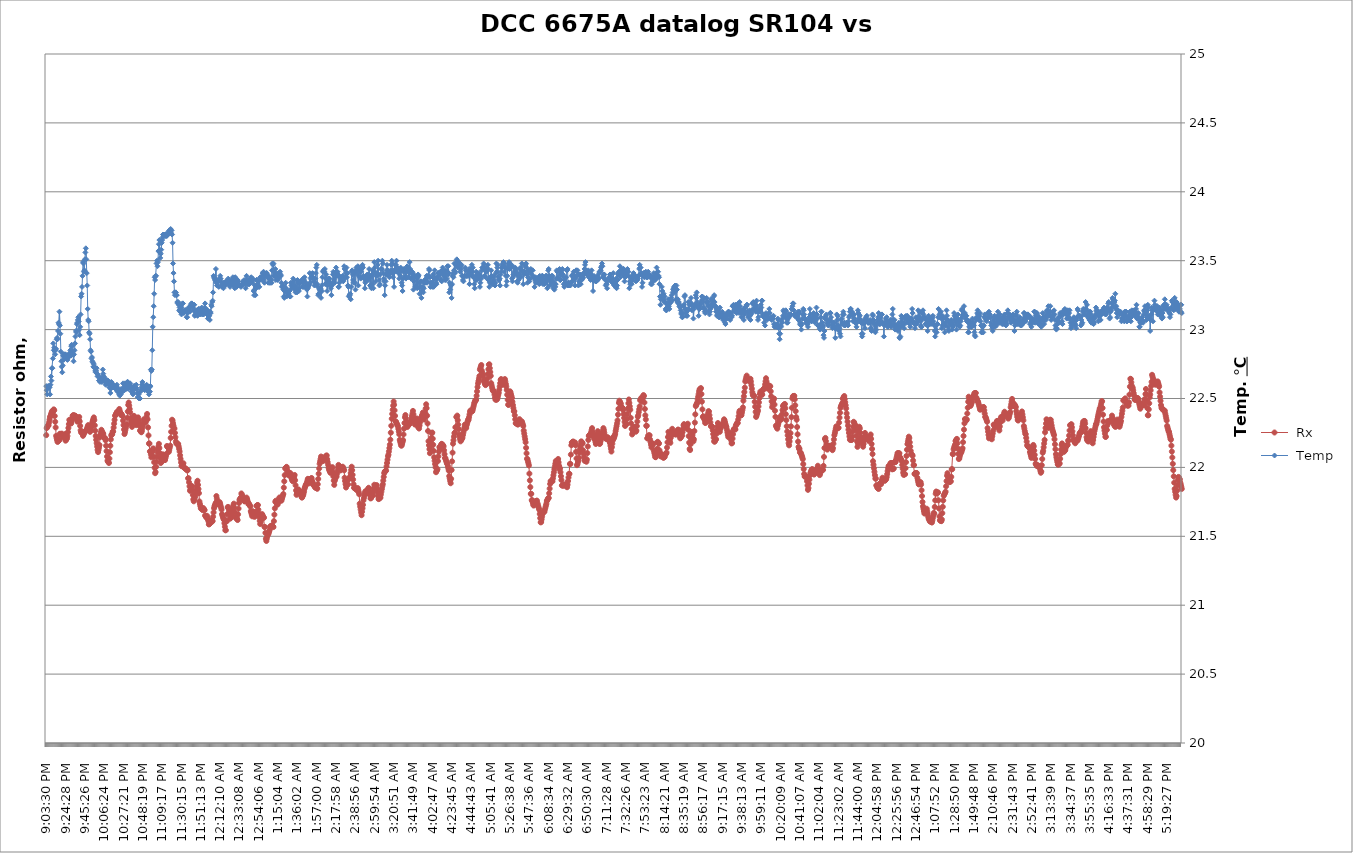
| Category |  Rx |
|---|---|
| 2021-03-04 21:03:30 | 9999.897 |
| 2021-03-04 21:04:01 | 9999.897 |
| 2021-03-04 21:04:32 | 9999.897 |
| 2021-03-04 21:05:02 | 9999.897 |
| 2021-03-04 21:05:33 | 9999.897 |
| 2021-03-04 21:06:04 | 9999.897 |
| 2021-03-04 21:06:34 | 9999.897 |
| 2021-03-04 21:07:05 | 9999.897 |
| 2021-03-04 21:07:36 | 9999.897 |
| 2021-03-04 21:08:06 | 9999.897 |
| 2021-03-04 21:08:37 | 9999.897 |
| 2021-03-04 21:09:08 | 9999.897 |
| 2021-03-04 21:09:38 | 9999.897 |
| 2021-03-04 21:10:09 | 9999.897 |
| 2021-03-04 21:10:40 | 9999.897 |
| 2021-03-04 21:11:10 | 9999.897 |
| 2021-03-04 21:11:41 | 9999.897 |
| 2021-03-04 21:12:12 | 9999.897 |
| 2021-03-04 21:12:42 | 9999.897 |
| 2021-03-04 21:13:13 | 9999.897 |
| 2021-03-04 21:13:44 | 9999.897 |
| 2021-03-04 21:14:14 | 9999.897 |
| 2021-03-04 21:14:45 | 9999.897 |
| 2021-03-04 21:15:16 | 9999.897 |
| 2021-03-04 21:15:46 | 9999.897 |
| 2021-03-04 21:16:17 | 9999.897 |
| 2021-03-04 21:16:48 | 9999.897 |
| 2021-03-04 21:17:19 | 9999.897 |
| 2021-03-04 21:17:49 | 9999.897 |
| 2021-03-04 21:18:20 | 9999.897 |
| 2021-03-04 21:18:51 | 9999.897 |
| 2021-03-04 21:19:21 | 9999.897 |
| 2021-03-04 21:19:52 | 9999.897 |
| 2021-03-04 21:20:23 | 9999.897 |
| 2021-03-04 21:20:53 | 9999.897 |
| 2021-03-04 21:21:24 | 9999.897 |
| 2021-03-04 21:21:55 | 9999.897 |
| 2021-03-04 21:22:25 | 9999.897 |
| 2021-03-04 21:22:56 | 9999.897 |
| 2021-03-04 21:23:27 | 9999.897 |
| 2021-03-04 21:23:57 | 9999.897 |
| 2021-03-04 21:24:28 | 9999.897 |
| 2021-03-04 21:24:59 | 9999.897 |
| 2021-03-04 21:25:29 | 9999.897 |
| 2021-03-04 21:26:00 | 9999.897 |
| 2021-03-04 21:26:31 | 9999.897 |
| 2021-03-04 21:27:01 | 9999.897 |
| 2021-03-04 21:27:32 | 9999.897 |
| 2021-03-04 21:28:03 | 9999.897 |
| 2021-03-04 21:28:33 | 9999.897 |
| 2021-03-04 21:29:04 | 9999.897 |
| 2021-03-04 21:29:35 | 9999.897 |
| 2021-03-04 21:30:05 | 9999.897 |
| 2021-03-04 21:30:36 | 9999.897 |
| 2021-03-04 21:31:07 | 9999.897 |
| 2021-03-04 21:31:37 | 9999.897 |
| 2021-03-04 21:32:08 | 9999.897 |
| 2021-03-04 21:32:39 | 9999.897 |
| 2021-03-04 21:33:10 | 9999.897 |
| 2021-03-04 21:33:40 | 9999.897 |
| 2021-03-04 21:34:11 | 9999.897 |
| 2021-03-04 21:34:42 | 9999.897 |
| 2021-03-04 21:35:12 | 9999.897 |
| 2021-03-04 21:35:43 | 9999.897 |
| 2021-03-04 21:36:14 | 9999.897 |
| 2021-03-04 21:36:44 | 9999.897 |
| 2021-03-04 21:37:15 | 9999.897 |
| 2021-03-04 21:37:46 | 9999.897 |
| 2021-03-04 21:38:16 | 9999.897 |
| 2021-03-04 21:38:47 | 9999.897 |
| 2021-03-04 21:39:18 | 9999.897 |
| 2021-03-04 21:39:48 | 9999.897 |
| 2021-03-04 21:40:19 | 9999.897 |
| 2021-03-04 21:40:50 | 9999.897 |
| 2021-03-04 21:41:20 | 9999.897 |
| 2021-03-04 21:41:51 | 9999.897 |
| 2021-03-04 21:42:22 | 9999.897 |
| 2021-03-04 21:42:52 | 9999.897 |
| 2021-03-04 21:43:23 | 9999.897 |
| 2021-03-04 21:43:54 | 9999.897 |
| 2021-03-04 21:44:24 | 9999.897 |
| 2021-03-04 21:44:55 | 9999.897 |
| 2021-03-04 21:45:26 | 9999.897 |
| 2021-03-04 21:45:57 | 9999.897 |
| 2021-03-04 21:46:27 | 9999.897 |
| 2021-03-04 21:46:58 | 9999.897 |
| 2021-03-04 21:47:29 | 9999.897 |
| 2021-03-04 21:47:59 | 9999.897 |
| 2021-03-04 21:48:30 | 9999.897 |
| 2021-03-04 21:49:01 | 9999.897 |
| 2021-03-04 21:49:31 | 9999.897 |
| 2021-03-04 21:50:02 | 9999.897 |
| 2021-03-04 21:50:33 | 9999.897 |
| 2021-03-04 21:51:03 | 9999.897 |
| 2021-03-04 21:51:34 | 9999.897 |
| 2021-03-04 21:52:05 | 9999.897 |
| 2021-03-04 21:52:35 | 9999.897 |
| 2021-03-04 21:53:06 | 9999.897 |
| 2021-03-04 21:53:37 | 9999.897 |
| 2021-03-04 21:54:07 | 9999.897 |
| 2021-03-04 21:54:38 | 9999.897 |
| 2021-03-04 21:55:09 | 9999.897 |
| 2021-03-04 21:55:39 | 9999.897 |
| 2021-03-04 21:56:10 | 9999.897 |
| 2021-03-04 21:56:41 | 9999.897 |
| 2021-03-04 21:57:11 | 9999.897 |
| 2021-03-04 21:57:42 | 9999.897 |
| 2021-03-04 21:58:13 | 9999.897 |
| 2021-03-04 21:58:43 | 9999.897 |
| 2021-03-04 21:59:14 | 9999.897 |
| 2021-03-04 21:59:45 | 9999.897 |
| 2021-03-04 22:00:15 | 9999.897 |
| 2021-03-04 22:00:46 | 9999.897 |
| 2021-03-04 22:01:17 | 9999.897 |
| 2021-03-04 22:01:48 | 9999.897 |
| 2021-03-04 22:02:18 | 9999.897 |
| 2021-03-04 22:02:49 | 9999.897 |
| 2021-03-04 22:03:20 | 9999.897 |
| 2021-03-04 22:03:50 | 9999.897 |
| 2021-03-04 22:04:21 | 9999.897 |
| 2021-03-04 22:04:52 | 9999.897 |
| 2021-03-04 22:05:22 | 9999.897 |
| 2021-03-04 22:05:53 | 9999.897 |
| 2021-03-04 22:06:24 | 9999.897 |
| 2021-03-04 22:06:54 | 9999.897 |
| 2021-03-04 22:07:25 | 9999.897 |
| 2021-03-04 22:07:56 | 9999.897 |
| 2021-03-04 22:08:26 | 9999.897 |
| 2021-03-04 22:08:57 | 9999.897 |
| 2021-03-04 22:09:28 | 9999.897 |
| 2021-03-04 22:09:58 | 9999.897 |
| 2021-03-04 22:10:29 | 9999.897 |
| 2021-03-04 22:11:00 | 9999.897 |
| 2021-03-04 22:11:30 | 9999.897 |
| 2021-03-04 22:12:01 | 9999.897 |
| 2021-03-04 22:12:32 | 9999.897 |
| 2021-03-04 22:13:02 | 9999.897 |
| 2021-03-04 22:13:33 | 9999.897 |
| 2021-03-04 22:14:04 | 9999.897 |
| 2021-03-04 22:14:34 | 9999.897 |
| 2021-03-04 22:15:05 | 9999.897 |
| 2021-03-04 22:15:36 | 9999.897 |
| 2021-03-04 22:16:06 | 9999.897 |
| 2021-03-04 22:16:37 | 9999.897 |
| 2021-03-04 22:17:08 | 9999.897 |
| 2021-03-04 22:17:38 | 9999.897 |
| 2021-03-04 22:18:09 | 9999.897 |
| 2021-03-04 22:18:40 | 9999.897 |
| 2021-03-04 22:19:10 | 9999.897 |
| 2021-03-04 22:19:41 | 9999.897 |
| 2021-03-04 22:20:12 | 9999.897 |
| 2021-03-04 22:20:43 | 9999.897 |
| 2021-03-04 22:21:13 | 9999.897 |
| 2021-03-04 22:21:44 | 9999.897 |
| 2021-03-04 22:22:15 | 9999.897 |
| 2021-03-04 22:22:45 | 9999.897 |
| 2021-03-04 22:23:16 | 9999.897 |
| 2021-03-04 22:23:47 | 9999.897 |
| 2021-03-04 22:24:17 | 9999.897 |
| 2021-03-04 22:24:48 | 9999.897 |
| 2021-03-04 22:25:19 | 9999.897 |
| 2021-03-04 22:25:49 | 9999.897 |
| 2021-03-04 22:26:20 | 9999.897 |
| 2021-03-04 22:26:51 | 9999.897 |
| 2021-03-04 22:27:21 | 9999.897 |
| 2021-03-04 22:27:52 | 9999.897 |
| 2021-03-04 22:28:23 | 9999.897 |
| 2021-03-04 22:28:53 | 9999.897 |
| 2021-03-04 22:29:24 | 9999.897 |
| 2021-03-04 22:29:55 | 9999.897 |
| 2021-03-04 22:30:25 | 9999.897 |
| 2021-03-04 22:30:56 | 9999.897 |
| 2021-03-04 22:31:27 | 9999.897 |
| 2021-03-04 22:31:57 | 9999.897 |
| 2021-03-04 22:32:28 | 9999.897 |
| 2021-03-04 22:32:59 | 9999.897 |
| 2021-03-04 22:33:29 | 9999.897 |
| 2021-03-04 22:34:00 | 9999.897 |
| 2021-03-04 22:34:31 | 9999.897 |
| 2021-03-04 22:35:01 | 9999.897 |
| 2021-03-04 22:35:32 | 9999.897 |
| 2021-03-04 22:36:03 | 9999.897 |
| 2021-03-04 22:36:33 | 9999.897 |
| 2021-03-04 22:37:04 | 9999.897 |
| 2021-03-04 22:37:35 | 9999.897 |
| 2021-03-04 22:38:06 | 9999.897 |
| 2021-03-04 22:38:36 | 9999.897 |
| 2021-03-04 22:39:07 | 9999.897 |
| 2021-03-04 22:39:38 | 9999.897 |
| 2021-03-04 22:40:08 | 9999.897 |
| 2021-03-04 22:40:39 | 9999.897 |
| 2021-03-04 22:41:10 | 9999.897 |
| 2021-03-04 22:41:40 | 9999.897 |
| 2021-03-04 22:42:11 | 9999.897 |
| 2021-03-04 22:42:42 | 9999.897 |
| 2021-03-04 22:43:12 | 9999.897 |
| 2021-03-04 22:43:43 | 9999.897 |
| 2021-03-04 22:44:14 | 9999.897 |
| 2021-03-04 22:44:44 | 9999.897 |
| 2021-03-04 22:45:15 | 9999.897 |
| 2021-03-04 22:45:46 | 9999.897 |
| 2021-03-04 22:46:16 | 9999.897 |
| 2021-03-04 22:46:47 | 9999.897 |
| 2021-03-04 22:47:18 | 9999.897 |
| 2021-03-04 22:47:48 | 9999.897 |
| 2021-03-04 22:48:19 | 9999.897 |
| 2021-03-04 22:48:50 | 9999.897 |
| 2021-03-04 22:49:20 | 9999.897 |
| 2021-03-04 22:49:51 | 9999.897 |
| 2021-03-04 22:50:22 | 9999.897 |
| 2021-03-04 22:50:52 | 9999.897 |
| 2021-03-04 22:51:23 | 9999.897 |
| 2021-03-04 22:51:54 | 9999.897 |
| 2021-03-04 22:52:24 | 9999.897 |
| 2021-03-04 22:52:55 | 9999.897 |
| 2021-03-04 22:53:26 | 9999.897 |
| 2021-03-04 22:53:56 | 9999.897 |
| 2021-03-04 22:54:27 | 9999.897 |
| 2021-03-04 22:54:58 | 9999.897 |
| 2021-03-04 22:55:28 | 9999.897 |
| 2021-03-04 22:55:59 | 9999.897 |
| 2021-03-04 22:56:30 | 9999.897 |
| 2021-03-04 22:57:00 | 9999.897 |
| 2021-03-04 22:57:31 | 9999.897 |
| 2021-03-04 22:58:02 | 9999.897 |
| 2021-03-04 22:58:33 | 9999.897 |
| 2021-03-04 22:59:03 | 9999.897 |
| 2021-03-04 22:59:34 | 9999.897 |
| 2021-03-04 23:00:05 | 9999.897 |
| 2021-03-04 23:00:35 | 9999.897 |
| 2021-03-04 23:01:06 | 9999.897 |
| 2021-03-04 23:01:37 | 9999.897 |
| 2021-03-04 23:02:07 | 9999.897 |
| 2021-03-04 23:02:38 | 9999.897 |
| 2021-03-04 23:03:09 | 9999.897 |
| 2021-03-04 23:03:39 | 9999.897 |
| 2021-03-04 23:04:10 | 9999.897 |
| 2021-03-04 23:04:41 | 9999.897 |
| 2021-03-04 23:05:11 | 9999.897 |
| 2021-03-04 23:05:42 | 9999.897 |
| 2021-03-04 23:06:13 | 9999.897 |
| 2021-03-04 23:06:43 | 9999.897 |
| 2021-03-04 23:07:14 | 9999.897 |
| 2021-03-04 23:07:45 | 9999.897 |
| 2021-03-04 23:08:15 | 9999.897 |
| 2021-03-04 23:08:46 | 9999.897 |
| 2021-03-04 23:09:17 | 9999.897 |
| 2021-03-04 23:09:47 | 9999.897 |
| 2021-03-04 23:10:18 | 9999.897 |
| 2021-03-04 23:10:49 | 9999.897 |
| 2021-03-04 23:11:20 | 9999.897 |
| 2021-03-04 23:11:50 | 9999.897 |
| 2021-03-04 23:12:21 | 9999.897 |
| 2021-03-04 23:12:52 | 9999.897 |
| 2021-03-04 23:13:22 | 9999.897 |
| 2021-03-04 23:13:53 | 9999.897 |
| 2021-03-04 23:14:24 | 9999.897 |
| 2021-03-04 23:14:54 | 9999.897 |
| 2021-03-04 23:15:25 | 9999.897 |
| 2021-03-04 23:15:56 | 9999.897 |
| 2021-03-04 23:16:26 | 9999.897 |
| 2021-03-04 23:16:57 | 9999.897 |
| 2021-03-04 23:17:28 | 9999.897 |
| 2021-03-04 23:17:58 | 9999.897 |
| 2021-03-04 23:18:29 | 9999.897 |
| 2021-03-04 23:19:00 | 9999.897 |
| 2021-03-04 23:19:30 | 9999.897 |
| 2021-03-04 23:20:01 | 9999.897 |
| 2021-03-04 23:20:32 | 9999.897 |
| 2021-03-04 23:21:02 | 9999.897 |
| 2021-03-04 23:21:33 | 9999.897 |
| 2021-03-04 23:22:04 | 9999.897 |
| 2021-03-04 23:22:35 | 9999.897 |
| 2021-03-04 23:23:05 | 9999.897 |
| 2021-03-04 23:23:36 | 9999.897 |
| 2021-03-04 23:24:07 | 9999.897 |
| 2021-03-04 23:24:37 | 9999.897 |
| 2021-03-04 23:25:08 | 9999.897 |
| 2021-03-04 23:25:39 | 9999.897 |
| 2021-03-04 23:26:09 | 9999.897 |
| 2021-03-04 23:26:40 | 9999.897 |
| 2021-03-04 23:27:11 | 9999.897 |
| 2021-03-04 23:27:41 | 9999.897 |
| 2021-03-04 23:28:12 | 9999.897 |
| 2021-03-04 23:28:43 | 9999.897 |
| 2021-03-04 23:29:13 | 9999.897 |
| 2021-03-04 23:29:44 | 9999.897 |
| 2021-03-04 23:30:15 | 9999.897 |
| 2021-03-04 23:30:45 | 9999.897 |
| 2021-03-04 23:31:16 | 9999.897 |
| 2021-03-04 23:31:47 | 9999.897 |
| 2021-03-04 23:32:17 | 9999.897 |
| 2021-03-04 23:32:48 | 9999.897 |
| 2021-03-04 23:33:19 | 9999.897 |
| 2021-03-04 23:33:49 | 9999.897 |
| 2021-03-04 23:34:20 | 9999.897 |
| 2021-03-04 23:34:51 | 9999.897 |
| 2021-03-04 23:35:22 | 9999.897 |
| 2021-03-04 23:35:52 | 9999.897 |
| 2021-03-04 23:36:23 | 9999.897 |
| 2021-03-04 23:36:54 | 9999.897 |
| 2021-03-04 23:37:24 | 9999.897 |
| 2021-03-04 23:37:55 | 9999.897 |
| 2021-03-04 23:38:26 | 9999.897 |
| 2021-03-04 23:38:56 | 9999.897 |
| 2021-03-04 23:39:27 | 9999.897 |
| 2021-03-04 23:39:58 | 9999.897 |
| 2021-03-04 23:40:28 | 9999.897 |
| 2021-03-04 23:40:59 | 9999.897 |
| 2021-03-04 23:41:30 | 9999.897 |
| 2021-03-04 23:42:00 | 9999.897 |
| 2021-03-04 23:42:31 | 9999.897 |
| 2021-03-04 23:43:02 | 9999.897 |
| 2021-03-04 23:43:32 | 9999.897 |
| 2021-03-04 23:44:03 | 9999.897 |
| 2021-03-04 23:44:34 | 9999.897 |
| 2021-03-04 23:45:04 | 9999.897 |
| 2021-03-04 23:45:35 | 9999.897 |
| 2021-03-04 23:46:06 | 9999.897 |
| 2021-03-04 23:46:36 | 9999.897 |
| 2021-03-04 23:47:07 | 9999.897 |
| 2021-03-04 23:47:38 | 9999.897 |
| 2021-03-04 23:48:08 | 9999.897 |
| 2021-03-04 23:48:39 | 9999.897 |
| 2021-03-04 23:49:10 | 9999.897 |
| 2021-03-04 23:49:41 | 9999.897 |
| 2021-03-04 23:50:11 | 9999.897 |
| 2021-03-04 23:50:42 | 9999.897 |
| 2021-03-04 23:51:13 | 9999.897 |
| 2021-03-04 23:51:43 | 9999.897 |
| 2021-03-04 23:52:14 | 9999.897 |
| 2021-03-04 23:52:45 | 9999.897 |
| 2021-03-04 23:53:15 | 9999.897 |
| 2021-03-04 23:53:46 | 9999.897 |
| 2021-03-04 23:54:17 | 9999.897 |
| 2021-03-04 23:54:47 | 9999.897 |
| 2021-03-04 23:55:18 | 9999.897 |
| 2021-03-04 23:55:49 | 9999.897 |
| 2021-03-04 23:56:19 | 9999.897 |
| 2021-03-04 23:56:50 | 9999.897 |
| 2021-03-04 23:57:21 | 9999.897 |
| 2021-03-04 23:57:51 | 9999.897 |
| 2021-03-04 23:58:22 | 9999.897 |
| 2021-03-04 23:58:53 | 9999.897 |
| 2021-03-04 23:59:23 | 9999.897 |
| 2021-03-04 23:59:54 | 9999.897 |
| 2021-03-05 00:00:25 | 9999.897 |
| 2021-03-05 00:00:55 | 9999.897 |
| 2021-03-05 00:01:26 | 9999.897 |
| 2021-03-05 00:01:57 | 9999.897 |
| 2021-03-05 00:02:28 | 9999.897 |
| 2021-03-05 00:02:58 | 9999.897 |
| 2021-03-05 00:03:29 | 9999.897 |
| 2021-03-05 00:04:00 | 9999.897 |
| 2021-03-05 00:04:30 | 9999.897 |
| 2021-03-05 00:05:01 | 9999.897 |
| 2021-03-05 00:05:32 | 9999.897 |
| 2021-03-05 00:06:02 | 9999.897 |
| 2021-03-05 00:06:33 | 9999.897 |
| 2021-03-05 00:07:04 | 9999.897 |
| 2021-03-05 00:07:34 | 9999.897 |
| 2021-03-05 00:08:05 | 9999.897 |
| 2021-03-05 00:08:36 | 9999.897 |
| 2021-03-05 00:09:06 | 9999.897 |
| 2021-03-05 00:09:37 | 9999.897 |
| 2021-03-05 00:10:08 | 9999.897 |
| 2021-03-05 00:10:38 | 9999.897 |
| 2021-03-05 00:11:09 | 9999.897 |
| 2021-03-05 00:11:40 | 9999.897 |
| 2021-03-05 00:12:10 | 9999.897 |
| 2021-03-05 00:12:41 | 9999.897 |
| 2021-03-05 00:13:12 | 9999.897 |
| 2021-03-05 00:13:43 | 9999.897 |
| 2021-03-05 00:14:13 | 9999.897 |
| 2021-03-05 00:14:44 | 9999.897 |
| 2021-03-05 00:15:15 | 9999.897 |
| 2021-03-05 00:15:45 | 9999.897 |
| 2021-03-05 00:16:16 | 9999.897 |
| 2021-03-05 00:16:47 | 9999.897 |
| 2021-03-05 00:17:17 | 9999.897 |
| 2021-03-05 00:17:48 | 9999.897 |
| 2021-03-05 00:18:19 | 9999.897 |
| 2021-03-05 00:18:49 | 9999.897 |
| 2021-03-05 00:19:20 | 9999.897 |
| 2021-03-05 00:19:51 | 9999.897 |
| 2021-03-05 00:20:21 | 9999.897 |
| 2021-03-05 00:20:52 | 9999.897 |
| 2021-03-05 00:21:23 | 9999.897 |
| 2021-03-05 00:21:53 | 9999.897 |
| 2021-03-05 00:22:24 | 9999.897 |
| 2021-03-05 00:22:55 | 9999.897 |
| 2021-03-05 00:23:25 | 9999.897 |
| 2021-03-05 00:23:56 | 9999.897 |
| 2021-03-05 00:24:27 | 9999.897 |
| 2021-03-05 00:24:58 | 9999.897 |
| 2021-03-05 00:25:28 | 9999.897 |
| 2021-03-05 00:25:59 | 9999.897 |
| 2021-03-05 00:26:30 | 9999.897 |
| 2021-03-05 00:27:00 | 9999.897 |
| 2021-03-05 00:27:31 | 9999.897 |
| 2021-03-05 00:28:02 | 9999.897 |
| 2021-03-05 00:28:32 | 9999.897 |
| 2021-03-05 00:29:03 | 9999.897 |
| 2021-03-05 00:29:34 | 9999.897 |
| 2021-03-05 00:30:04 | 9999.897 |
| 2021-03-05 00:30:35 | 9999.897 |
| 2021-03-05 00:31:06 | 9999.897 |
| 2021-03-05 00:31:36 | 9999.897 |
| 2021-03-05 00:32:07 | 9999.897 |
| 2021-03-05 00:32:38 | 9999.897 |
| 2021-03-05 00:33:08 | 9999.897 |
| 2021-03-05 00:33:39 | 9999.897 |
| 2021-03-05 00:34:10 | 9999.897 |
| 2021-03-05 00:34:40 | 9999.897 |
| 2021-03-05 00:35:11 | 9999.897 |
| 2021-03-05 00:35:42 | 9999.897 |
| 2021-03-05 00:36:13 | 9999.897 |
| 2021-03-05 00:36:43 | 9999.897 |
| 2021-03-05 00:37:14 | 9999.897 |
| 2021-03-05 00:37:45 | 9999.897 |
| 2021-03-05 00:38:15 | 9999.897 |
| 2021-03-05 00:38:46 | 9999.897 |
| 2021-03-05 00:39:17 | 9999.897 |
| 2021-03-05 00:39:47 | 9999.897 |
| 2021-03-05 00:40:18 | 9999.897 |
| 2021-03-05 00:40:49 | 9999.897 |
| 2021-03-05 00:41:19 | 9999.897 |
| 2021-03-05 00:41:50 | 9999.897 |
| 2021-03-05 00:42:21 | 9999.897 |
| 2021-03-05 00:42:51 | 9999.897 |
| 2021-03-05 00:43:22 | 9999.897 |
| 2021-03-05 00:43:53 | 9999.897 |
| 2021-03-05 00:44:23 | 9999.897 |
| 2021-03-05 00:44:54 | 9999.897 |
| 2021-03-05 00:45:25 | 9999.897 |
| 2021-03-05 00:45:56 | 9999.897 |
| 2021-03-05 00:46:26 | 9999.897 |
| 2021-03-05 00:46:57 | 9999.897 |
| 2021-03-05 00:47:28 | 9999.897 |
| 2021-03-05 00:47:58 | 9999.897 |
| 2021-03-05 00:48:29 | 9999.897 |
| 2021-03-05 00:49:00 | 9999.897 |
| 2021-03-05 00:49:30 | 9999.897 |
| 2021-03-05 00:50:01 | 9999.897 |
| 2021-03-05 00:50:32 | 9999.897 |
| 2021-03-05 00:51:02 | 9999.897 |
| 2021-03-05 00:51:33 | 9999.897 |
| 2021-03-05 00:52:04 | 9999.897 |
| 2021-03-05 00:52:34 | 9999.897 |
| 2021-03-05 00:53:05 | 9999.897 |
| 2021-03-05 00:53:36 | 9999.897 |
| 2021-03-05 00:54:06 | 9999.897 |
| 2021-03-05 00:54:37 | 9999.897 |
| 2021-03-05 00:55:08 | 9999.897 |
| 2021-03-05 00:55:38 | 9999.897 |
| 2021-03-05 00:56:09 | 9999.897 |
| 2021-03-05 00:56:40 | 9999.897 |
| 2021-03-05 00:57:10 | 9999.897 |
| 2021-03-05 00:57:41 | 9999.897 |
| 2021-03-05 00:58:12 | 9999.897 |
| 2021-03-05 00:58:43 | 9999.897 |
| 2021-03-05 00:59:13 | 9999.897 |
| 2021-03-05 00:59:44 | 9999.897 |
| 2021-03-05 01:00:15 | 9999.897 |
| 2021-03-05 01:00:45 | 9999.897 |
| 2021-03-05 01:01:16 | 9999.897 |
| 2021-03-05 01:01:47 | 9999.896 |
| 2021-03-05 01:02:17 | 9999.896 |
| 2021-03-05 01:02:48 | 9999.896 |
| 2021-03-05 01:03:19 | 9999.897 |
| 2021-03-05 01:03:49 | 9999.897 |
| 2021-03-05 01:04:20 | 9999.897 |
| 2021-03-05 01:04:51 | 9999.897 |
| 2021-03-05 01:05:21 | 9999.897 |
| 2021-03-05 01:05:52 | 9999.897 |
| 2021-03-05 01:06:23 | 9999.897 |
| 2021-03-05 01:06:53 | 9999.897 |
| 2021-03-05 01:07:24 | 9999.897 |
| 2021-03-05 01:07:55 | 9999.897 |
| 2021-03-05 01:08:25 | 9999.897 |
| 2021-03-05 01:08:56 | 9999.897 |
| 2021-03-05 01:09:27 | 9999.897 |
| 2021-03-05 01:09:58 | 9999.897 |
| 2021-03-05 01:10:28 | 9999.897 |
| 2021-03-05 01:10:59 | 9999.897 |
| 2021-03-05 01:11:30 | 9999.897 |
| 2021-03-05 01:12:00 | 9999.897 |
| 2021-03-05 01:12:31 | 9999.897 |
| 2021-03-05 01:13:02 | 9999.897 |
| 2021-03-05 01:13:32 | 9999.897 |
| 2021-03-05 01:14:03 | 9999.897 |
| 2021-03-05 01:14:34 | 9999.897 |
| 2021-03-05 01:15:04 | 9999.897 |
| 2021-03-05 01:15:35 | 9999.897 |
| 2021-03-05 01:16:06 | 9999.897 |
| 2021-03-05 01:16:36 | 9999.897 |
| 2021-03-05 01:17:07 | 9999.897 |
| 2021-03-05 01:17:38 | 9999.897 |
| 2021-03-05 01:18:08 | 9999.897 |
| 2021-03-05 01:18:39 | 9999.897 |
| 2021-03-05 01:19:10 | 9999.897 |
| 2021-03-05 01:19:40 | 9999.897 |
| 2021-03-05 01:20:11 | 9999.897 |
| 2021-03-05 01:20:42 | 9999.897 |
| 2021-03-05 01:21:13 | 9999.897 |
| 2021-03-05 01:21:43 | 9999.897 |
| 2021-03-05 01:22:14 | 9999.897 |
| 2021-03-05 01:22:45 | 9999.897 |
| 2021-03-05 01:23:15 | 9999.897 |
| 2021-03-05 01:23:46 | 9999.897 |
| 2021-03-05 01:24:17 | 9999.897 |
| 2021-03-05 01:24:47 | 9999.897 |
| 2021-03-05 01:25:18 | 9999.897 |
| 2021-03-05 01:25:49 | 9999.897 |
| 2021-03-05 01:26:19 | 9999.897 |
| 2021-03-05 01:26:50 | 9999.897 |
| 2021-03-05 01:27:21 | 9999.897 |
| 2021-03-05 01:27:51 | 9999.897 |
| 2021-03-05 01:28:22 | 9999.897 |
| 2021-03-05 01:28:53 | 9999.897 |
| 2021-03-05 01:29:23 | 9999.897 |
| 2021-03-05 01:29:54 | 9999.897 |
| 2021-03-05 01:30:25 | 9999.897 |
| 2021-03-05 01:30:55 | 9999.897 |
| 2021-03-05 01:31:26 | 9999.897 |
| 2021-03-05 01:31:57 | 9999.897 |
| 2021-03-05 01:32:27 | 9999.897 |
| 2021-03-05 01:32:58 | 9999.897 |
| 2021-03-05 01:33:29 | 9999.897 |
| 2021-03-05 01:34:00 | 9999.897 |
| 2021-03-05 01:34:30 | 9999.897 |
| 2021-03-05 01:35:01 | 9999.897 |
| 2021-03-05 01:35:32 | 9999.897 |
| 2021-03-05 01:36:02 | 9999.897 |
| 2021-03-05 01:36:33 | 9999.897 |
| 2021-03-05 01:37:04 | 9999.897 |
| 2021-03-05 01:37:34 | 9999.897 |
| 2021-03-05 01:38:05 | 9999.897 |
| 2021-03-05 01:38:36 | 9999.897 |
| 2021-03-05 01:39:06 | 9999.897 |
| 2021-03-05 01:39:37 | 9999.897 |
| 2021-03-05 01:40:08 | 9999.897 |
| 2021-03-05 01:40:38 | 9999.897 |
| 2021-03-05 01:41:09 | 9999.897 |
| 2021-03-05 01:41:40 | 9999.897 |
| 2021-03-05 01:42:10 | 9999.897 |
| 2021-03-05 01:42:41 | 9999.897 |
| 2021-03-05 01:43:12 | 9999.897 |
| 2021-03-05 01:43:42 | 9999.897 |
| 2021-03-05 01:44:13 | 9999.897 |
| 2021-03-05 01:44:44 | 9999.897 |
| 2021-03-05 01:45:14 | 9999.897 |
| 2021-03-05 01:45:45 | 9999.897 |
| 2021-03-05 01:46:16 | 9999.897 |
| 2021-03-05 01:46:47 | 9999.897 |
| 2021-03-05 01:47:17 | 9999.897 |
| 2021-03-05 01:47:48 | 9999.897 |
| 2021-03-05 01:48:19 | 9999.897 |
| 2021-03-05 01:48:49 | 9999.897 |
| 2021-03-05 01:49:20 | 9999.897 |
| 2021-03-05 01:49:51 | 9999.897 |
| 2021-03-05 01:50:21 | 9999.897 |
| 2021-03-05 01:50:52 | 9999.897 |
| 2021-03-05 01:51:23 | 9999.897 |
| 2021-03-05 01:51:53 | 9999.897 |
| 2021-03-05 01:52:24 | 9999.897 |
| 2021-03-05 01:52:55 | 9999.897 |
| 2021-03-05 01:53:25 | 9999.897 |
| 2021-03-05 01:53:56 | 9999.897 |
| 2021-03-05 01:54:27 | 9999.897 |
| 2021-03-05 01:54:57 | 9999.897 |
| 2021-03-05 01:55:28 | 9999.897 |
| 2021-03-05 01:55:59 | 9999.897 |
| 2021-03-05 01:56:29 | 9999.897 |
| 2021-03-05 01:57:00 | 9999.897 |
| 2021-03-05 01:57:31 | 9999.897 |
| 2021-03-05 01:58:01 | 9999.897 |
| 2021-03-05 01:58:32 | 9999.897 |
| 2021-03-05 01:59:03 | 9999.897 |
| 2021-03-05 01:59:34 | 9999.897 |
| 2021-03-05 02:00:04 | 9999.897 |
| 2021-03-05 02:00:35 | 9999.897 |
| 2021-03-05 02:01:06 | 9999.897 |
| 2021-03-05 02:01:36 | 9999.897 |
| 2021-03-05 02:02:07 | 9999.897 |
| 2021-03-05 02:02:38 | 9999.897 |
| 2021-03-05 02:03:08 | 9999.897 |
| 2021-03-05 02:03:39 | 9999.897 |
| 2021-03-05 02:04:10 | 9999.897 |
| 2021-03-05 02:04:40 | 9999.897 |
| 2021-03-05 02:05:11 | 9999.897 |
| 2021-03-05 02:05:42 | 9999.897 |
| 2021-03-05 02:06:12 | 9999.897 |
| 2021-03-05 02:06:43 | 9999.897 |
| 2021-03-05 02:07:14 | 9999.897 |
| 2021-03-05 02:07:44 | 9999.897 |
| 2021-03-05 02:08:15 | 9999.897 |
| 2021-03-05 02:08:46 | 9999.897 |
| 2021-03-05 02:09:16 | 9999.897 |
| 2021-03-05 02:09:47 | 9999.897 |
| 2021-03-05 02:10:18 | 9999.897 |
| 2021-03-05 02:10:48 | 9999.897 |
| 2021-03-05 02:11:19 | 9999.897 |
| 2021-03-05 02:11:50 | 9999.897 |
| 2021-03-05 02:12:20 | 9999.897 |
| 2021-03-05 02:12:51 | 9999.897 |
| 2021-03-05 02:13:22 | 9999.897 |
| 2021-03-05 02:13:52 | 9999.897 |
| 2021-03-05 02:14:23 | 9999.897 |
| 2021-03-05 02:14:54 | 9999.897 |
| 2021-03-05 02:15:25 | 9999.897 |
| 2021-03-05 02:15:55 | 9999.897 |
| 2021-03-05 02:16:26 | 9999.897 |
| 2021-03-05 02:16:57 | 9999.897 |
| 2021-03-05 02:17:27 | 9999.897 |
| 2021-03-05 02:17:58 | 9999.897 |
| 2021-03-05 02:18:29 | 9999.897 |
| 2021-03-05 02:18:59 | 9999.897 |
| 2021-03-05 02:19:30 | 9999.897 |
| 2021-03-05 02:20:01 | 9999.897 |
| 2021-03-05 02:20:31 | 9999.897 |
| 2021-03-05 02:21:02 | 9999.897 |
| 2021-03-05 02:21:33 | 9999.897 |
| 2021-03-05 02:22:03 | 9999.897 |
| 2021-03-05 02:22:34 | 9999.897 |
| 2021-03-05 02:23:05 | 9999.897 |
| 2021-03-05 02:23:35 | 9999.897 |
| 2021-03-05 02:24:06 | 9999.897 |
| 2021-03-05 02:24:37 | 9999.897 |
| 2021-03-05 02:25:07 | 9999.897 |
| 2021-03-05 02:25:38 | 9999.897 |
| 2021-03-05 02:26:09 | 9999.897 |
| 2021-03-05 02:26:39 | 9999.897 |
| 2021-03-05 02:27:10 | 9999.897 |
| 2021-03-05 02:27:41 | 9999.897 |
| 2021-03-05 02:28:11 | 9999.897 |
| 2021-03-05 02:28:42 | 9999.897 |
| 2021-03-05 02:29:13 | 9999.897 |
| 2021-03-05 02:29:44 | 9999.897 |
| 2021-03-05 02:30:14 | 9999.897 |
| 2021-03-05 02:30:45 | 9999.897 |
| 2021-03-05 02:31:16 | 9999.897 |
| 2021-03-05 02:31:46 | 9999.897 |
| 2021-03-05 02:32:17 | 9999.897 |
| 2021-03-05 02:32:48 | 9999.897 |
| 2021-03-05 02:33:18 | 9999.897 |
| 2021-03-05 02:33:49 | 9999.897 |
| 2021-03-05 02:34:20 | 9999.897 |
| 2021-03-05 02:34:50 | 9999.897 |
| 2021-03-05 02:35:21 | 9999.897 |
| 2021-03-05 02:35:52 | 9999.897 |
| 2021-03-05 02:36:22 | 9999.897 |
| 2021-03-05 02:36:53 | 9999.897 |
| 2021-03-05 02:37:24 | 9999.897 |
| 2021-03-05 02:37:54 | 9999.897 |
| 2021-03-05 02:38:25 | 9999.897 |
| 2021-03-05 02:38:56 | 9999.897 |
| 2021-03-05 02:39:26 | 9999.897 |
| 2021-03-05 02:39:57 | 9999.897 |
| 2021-03-05 02:40:28 | 9999.897 |
| 2021-03-05 02:40:58 | 9999.897 |
| 2021-03-05 02:41:29 | 9999.897 |
| 2021-03-05 02:42:00 | 9999.897 |
| 2021-03-05 02:42:30 | 9999.897 |
| 2021-03-05 02:43:01 | 9999.897 |
| 2021-03-05 02:43:32 | 9999.897 |
| 2021-03-05 02:44:03 | 9999.897 |
| 2021-03-05 02:44:33 | 9999.897 |
| 2021-03-05 02:45:04 | 9999.897 |
| 2021-03-05 02:45:35 | 9999.897 |
| 2021-03-05 02:46:05 | 9999.897 |
| 2021-03-05 02:46:36 | 9999.897 |
| 2021-03-05 02:47:07 | 9999.897 |
| 2021-03-05 02:47:37 | 9999.897 |
| 2021-03-05 02:48:08 | 9999.897 |
| 2021-03-05 02:48:39 | 9999.897 |
| 2021-03-05 02:49:09 | 9999.897 |
| 2021-03-05 02:49:40 | 9999.897 |
| 2021-03-05 02:50:11 | 9999.897 |
| 2021-03-05 02:50:41 | 9999.897 |
| 2021-03-05 02:51:12 | 9999.897 |
| 2021-03-05 02:51:43 | 9999.897 |
| 2021-03-05 02:52:13 | 9999.897 |
| 2021-03-05 02:52:44 | 9999.897 |
| 2021-03-05 02:53:15 | 9999.897 |
| 2021-03-05 02:53:45 | 9999.897 |
| 2021-03-05 02:54:16 | 9999.897 |
| 2021-03-05 02:54:47 | 9999.897 |
| 2021-03-05 02:55:17 | 9999.897 |
| 2021-03-05 02:55:48 | 9999.897 |
| 2021-03-05 02:56:19 | 9999.897 |
| 2021-03-05 02:56:50 | 9999.897 |
| 2021-03-05 02:57:20 | 9999.897 |
| 2021-03-05 02:57:51 | 9999.897 |
| 2021-03-05 02:58:22 | 9999.897 |
| 2021-03-05 02:58:52 | 9999.897 |
| 2021-03-05 02:59:23 | 9999.897 |
| 2021-03-05 02:59:54 | 9999.897 |
| 2021-03-05 03:00:24 | 9999.897 |
| 2021-03-05 03:00:55 | 9999.897 |
| 2021-03-05 03:01:26 | 9999.897 |
| 2021-03-05 03:01:56 | 9999.897 |
| 2021-03-05 03:02:27 | 9999.897 |
| 2021-03-05 03:02:58 | 9999.897 |
| 2021-03-05 03:03:28 | 9999.897 |
| 2021-03-05 03:03:59 | 9999.897 |
| 2021-03-05 03:04:30 | 9999.897 |
| 2021-03-05 03:05:00 | 9999.897 |
| 2021-03-05 03:05:31 | 9999.897 |
| 2021-03-05 03:06:02 | 9999.897 |
| 2021-03-05 03:06:32 | 9999.897 |
| 2021-03-05 03:07:03 | 9999.897 |
| 2021-03-05 03:07:34 | 9999.897 |
| 2021-03-05 03:08:04 | 9999.897 |
| 2021-03-05 03:08:35 | 9999.897 |
| 2021-03-05 03:09:06 | 9999.897 |
| 2021-03-05 03:09:36 | 9999.897 |
| 2021-03-05 03:10:07 | 9999.897 |
| 2021-03-05 03:10:38 | 9999.897 |
| 2021-03-05 03:11:09 | 9999.897 |
| 2021-03-05 03:11:39 | 9999.897 |
| 2021-03-05 03:12:10 | 9999.897 |
| 2021-03-05 03:12:41 | 9999.897 |
| 2021-03-05 03:13:11 | 9999.897 |
| 2021-03-05 03:13:42 | 9999.897 |
| 2021-03-05 03:14:13 | 9999.897 |
| 2021-03-05 03:14:43 | 9999.897 |
| 2021-03-05 03:15:14 | 9999.897 |
| 2021-03-05 03:15:45 | 9999.897 |
| 2021-03-05 03:16:15 | 9999.897 |
| 2021-03-05 03:16:46 | 9999.897 |
| 2021-03-05 03:17:17 | 9999.897 |
| 2021-03-05 03:17:47 | 9999.897 |
| 2021-03-05 03:18:18 | 9999.897 |
| 2021-03-05 03:18:49 | 9999.897 |
| 2021-03-05 03:19:19 | 9999.897 |
| 2021-03-05 03:19:50 | 9999.897 |
| 2021-03-05 03:20:21 | 9999.897 |
| 2021-03-05 03:20:51 | 9999.897 |
| 2021-03-05 03:21:22 | 9999.897 |
| 2021-03-05 03:21:53 | 9999.897 |
| 2021-03-05 03:22:23 | 9999.897 |
| 2021-03-05 03:22:54 | 9999.897 |
| 2021-03-05 03:23:25 | 9999.897 |
| 2021-03-05 03:23:56 | 9999.897 |
| 2021-03-05 03:24:26 | 9999.897 |
| 2021-03-05 03:24:57 | 9999.897 |
| 2021-03-05 03:25:28 | 9999.897 |
| 2021-03-05 03:25:58 | 9999.897 |
| 2021-03-05 03:26:29 | 9999.897 |
| 2021-03-05 03:27:00 | 9999.897 |
| 2021-03-05 03:27:30 | 9999.897 |
| 2021-03-05 03:28:01 | 9999.897 |
| 2021-03-05 03:28:32 | 9999.897 |
| 2021-03-05 03:29:02 | 9999.897 |
| 2021-03-05 03:29:33 | 9999.897 |
| 2021-03-05 03:30:04 | 9999.897 |
| 2021-03-05 03:30:34 | 9999.897 |
| 2021-03-05 03:31:05 | 9999.897 |
| 2021-03-05 03:31:36 | 9999.897 |
| 2021-03-05 03:32:06 | 9999.897 |
| 2021-03-05 03:32:37 | 9999.897 |
| 2021-03-05 03:33:08 | 9999.897 |
| 2021-03-05 03:33:38 | 9999.897 |
| 2021-03-05 03:34:09 | 9999.897 |
| 2021-03-05 03:34:40 | 9999.897 |
| 2021-03-05 03:35:10 | 9999.897 |
| 2021-03-05 03:35:41 | 9999.897 |
| 2021-03-05 03:36:12 | 9999.897 |
| 2021-03-05 03:36:43 | 9999.897 |
| 2021-03-05 03:37:13 | 9999.897 |
| 2021-03-05 03:37:44 | 9999.897 |
| 2021-03-05 03:38:15 | 9999.897 |
| 2021-03-05 03:38:45 | 9999.897 |
| 2021-03-05 03:39:16 | 9999.897 |
| 2021-03-05 03:39:47 | 9999.897 |
| 2021-03-05 03:40:17 | 9999.897 |
| 2021-03-05 03:40:48 | 9999.897 |
| 2021-03-05 03:41:19 | 9999.897 |
| 2021-03-05 03:41:49 | 9999.897 |
| 2021-03-05 03:42:20 | 9999.897 |
| 2021-03-05 03:42:51 | 9999.897 |
| 2021-03-05 03:43:21 | 9999.897 |
| 2021-03-05 03:43:52 | 9999.897 |
| 2021-03-05 03:44:23 | 9999.897 |
| 2021-03-05 03:44:53 | 9999.897 |
| 2021-03-05 03:45:24 | 9999.897 |
| 2021-03-05 03:45:55 | 9999.897 |
| 2021-03-05 03:46:25 | 9999.897 |
| 2021-03-05 03:46:56 | 9999.897 |
| 2021-03-05 03:47:27 | 9999.897 |
| 2021-03-05 03:47:57 | 9999.897 |
| 2021-03-05 03:48:28 | 9999.897 |
| 2021-03-05 03:48:59 | 9999.897 |
| 2021-03-05 03:49:29 | 9999.897 |
| 2021-03-05 03:50:00 | 9999.897 |
| 2021-03-05 03:50:31 | 9999.897 |
| 2021-03-05 03:51:02 | 9999.897 |
| 2021-03-05 03:51:32 | 9999.897 |
| 2021-03-05 03:52:03 | 9999.897 |
| 2021-03-05 03:52:34 | 9999.897 |
| 2021-03-05 03:53:04 | 9999.897 |
| 2021-03-05 03:53:35 | 9999.897 |
| 2021-03-05 03:54:06 | 9999.897 |
| 2021-03-05 03:54:36 | 9999.897 |
| 2021-03-05 03:55:07 | 9999.897 |
| 2021-03-05 03:55:38 | 9999.897 |
| 2021-03-05 03:56:08 | 9999.897 |
| 2021-03-05 03:56:39 | 9999.897 |
| 2021-03-05 03:57:10 | 9999.897 |
| 2021-03-05 03:57:40 | 9999.897 |
| 2021-03-05 03:58:11 | 9999.897 |
| 2021-03-05 03:58:42 | 9999.897 |
| 2021-03-05 03:59:12 | 9999.897 |
| 2021-03-05 03:59:43 | 9999.897 |
| 2021-03-05 04:00:14 | 9999.897 |
| 2021-03-05 04:00:44 | 9999.897 |
| 2021-03-05 04:01:15 | 9999.897 |
| 2021-03-05 04:01:46 | 9999.897 |
| 2021-03-05 04:02:16 | 9999.897 |
| 2021-03-05 04:02:47 | 9999.897 |
| 2021-03-05 04:03:18 | 9999.897 |
| 2021-03-05 04:03:48 | 9999.897 |
| 2021-03-05 04:04:19 | 9999.897 |
| 2021-03-05 04:04:50 | 9999.897 |
| 2021-03-05 04:05:21 | 9999.897 |
| 2021-03-05 04:05:51 | 9999.897 |
| 2021-03-05 04:06:22 | 9999.897 |
| 2021-03-05 04:06:53 | 9999.897 |
| 2021-03-05 04:07:23 | 9999.897 |
| 2021-03-05 04:07:54 | 9999.897 |
| 2021-03-05 04:08:25 | 9999.897 |
| 2021-03-05 04:08:55 | 9999.897 |
| 2021-03-05 04:09:26 | 9999.897 |
| 2021-03-05 04:09:57 | 9999.897 |
| 2021-03-05 04:10:27 | 9999.897 |
| 2021-03-05 04:10:58 | 9999.897 |
| 2021-03-05 04:11:29 | 9999.897 |
| 2021-03-05 04:11:59 | 9999.897 |
| 2021-03-05 04:12:30 | 9999.897 |
| 2021-03-05 04:13:01 | 9999.897 |
| 2021-03-05 04:13:31 | 9999.897 |
| 2021-03-05 04:14:02 | 9999.897 |
| 2021-03-05 04:14:33 | 9999.897 |
| 2021-03-05 04:15:03 | 9999.897 |
| 2021-03-05 04:15:34 | 9999.897 |
| 2021-03-05 04:16:05 | 9999.897 |
| 2021-03-05 04:16:35 | 9999.897 |
| 2021-03-05 04:17:06 | 9999.897 |
| 2021-03-05 04:17:37 | 9999.897 |
| 2021-03-05 04:18:07 | 9999.897 |
| 2021-03-05 04:18:38 | 9999.897 |
| 2021-03-05 04:19:09 | 9999.897 |
| 2021-03-05 04:19:40 | 9999.897 |
| 2021-03-05 04:20:10 | 9999.897 |
| 2021-03-05 04:20:41 | 9999.897 |
| 2021-03-05 04:21:12 | 9999.897 |
| 2021-03-05 04:21:42 | 9999.897 |
| 2021-03-05 04:22:13 | 9999.897 |
| 2021-03-05 04:22:44 | 9999.897 |
| 2021-03-05 04:23:14 | 9999.897 |
| 2021-03-05 04:23:45 | 9999.897 |
| 2021-03-05 04:24:16 | 9999.897 |
| 2021-03-05 04:24:46 | 9999.897 |
| 2021-03-05 04:25:17 | 9999.897 |
| 2021-03-05 04:25:48 | 9999.897 |
| 2021-03-05 04:26:18 | 9999.897 |
| 2021-03-05 04:26:49 | 9999.897 |
| 2021-03-05 04:27:20 | 9999.897 |
| 2021-03-05 04:27:50 | 9999.897 |
| 2021-03-05 04:28:21 | 9999.897 |
| 2021-03-05 04:28:52 | 9999.897 |
| 2021-03-05 04:29:22 | 9999.897 |
| 2021-03-05 04:29:53 | 9999.897 |
| 2021-03-05 04:30:24 | 9999.897 |
| 2021-03-05 04:30:54 | 9999.897 |
| 2021-03-05 04:31:25 | 9999.897 |
| 2021-03-05 04:31:56 | 9999.897 |
| 2021-03-05 04:32:26 | 9999.897 |
| 2021-03-05 04:32:57 | 9999.897 |
| 2021-03-05 04:33:28 | 9999.897 |
| 2021-03-05 04:33:58 | 9999.897 |
| 2021-03-05 04:34:29 | 9999.897 |
| 2021-03-05 04:35:00 | 9999.897 |
| 2021-03-05 04:35:30 | 9999.897 |
| 2021-03-05 04:36:01 | 9999.897 |
| 2021-03-05 04:36:32 | 9999.897 |
| 2021-03-05 04:37:03 | 9999.897 |
| 2021-03-05 04:37:33 | 9999.897 |
| 2021-03-05 04:38:04 | 9999.897 |
| 2021-03-05 04:38:35 | 9999.897 |
| 2021-03-05 04:39:05 | 9999.897 |
| 2021-03-05 04:39:36 | 9999.897 |
| 2021-03-05 04:40:07 | 9999.897 |
| 2021-03-05 04:40:37 | 9999.897 |
| 2021-03-05 04:41:08 | 9999.897 |
| 2021-03-05 04:41:39 | 9999.897 |
| 2021-03-05 04:42:09 | 9999.897 |
| 2021-03-05 04:42:40 | 9999.897 |
| 2021-03-05 04:43:11 | 9999.897 |
| 2021-03-05 04:43:41 | 9999.897 |
| 2021-03-05 04:44:12 | 9999.897 |
| 2021-03-05 04:44:43 | 9999.897 |
| 2021-03-05 04:45:13 | 9999.897 |
| 2021-03-05 04:45:44 | 9999.897 |
| 2021-03-05 04:46:15 | 9999.897 |
| 2021-03-05 04:46:45 | 9999.897 |
| 2021-03-05 04:47:16 | 9999.897 |
| 2021-03-05 04:47:47 | 9999.897 |
| 2021-03-05 04:48:17 | 9999.897 |
| 2021-03-05 04:48:48 | 9999.897 |
| 2021-03-05 04:49:19 | 9999.897 |
| 2021-03-05 04:49:49 | 9999.897 |
| 2021-03-05 04:50:20 | 9999.898 |
| 2021-03-05 04:50:51 | 9999.898 |
| 2021-03-05 04:51:22 | 9999.898 |
| 2021-03-05 04:51:52 | 9999.898 |
| 2021-03-05 04:52:23 | 9999.898 |
| 2021-03-05 04:52:54 | 9999.898 |
| 2021-03-05 04:53:24 | 9999.898 |
| 2021-03-05 04:53:55 | 9999.898 |
| 2021-03-05 04:54:26 | 9999.898 |
| 2021-03-05 04:54:56 | 9999.898 |
| 2021-03-05 04:55:27 | 9999.898 |
| 2021-03-05 04:55:58 | 9999.898 |
| 2021-03-05 04:56:28 | 9999.898 |
| 2021-03-05 04:56:59 | 9999.898 |
| 2021-03-05 04:57:30 | 9999.898 |
| 2021-03-05 04:58:00 | 9999.898 |
| 2021-03-05 04:58:31 | 9999.898 |
| 2021-03-05 04:59:02 | 9999.898 |
| 2021-03-05 04:59:32 | 9999.898 |
| 2021-03-05 05:00:03 | 9999.898 |
| 2021-03-05 05:00:34 | 9999.898 |
| 2021-03-05 05:01:04 | 9999.898 |
| 2021-03-05 05:01:35 | 9999.898 |
| 2021-03-05 05:02:06 | 9999.898 |
| 2021-03-05 05:02:36 | 9999.898 |
| 2021-03-05 05:03:07 | 9999.898 |
| 2021-03-05 05:03:38 | 9999.898 |
| 2021-03-05 05:04:08 | 9999.898 |
| 2021-03-05 05:04:39 | 9999.898 |
| 2021-03-05 05:05:10 | 9999.898 |
| 2021-03-05 05:05:41 | 9999.898 |
| 2021-03-05 05:06:11 | 9999.898 |
| 2021-03-05 05:06:42 | 9999.898 |
| 2021-03-05 05:07:13 | 9999.898 |
| 2021-03-05 05:07:43 | 9999.898 |
| 2021-03-05 05:08:14 | 9999.898 |
| 2021-03-05 05:08:45 | 9999.898 |
| 2021-03-05 05:09:15 | 9999.898 |
| 2021-03-05 05:09:46 | 9999.898 |
| 2021-03-05 05:10:17 | 9999.898 |
| 2021-03-05 05:10:47 | 9999.897 |
| 2021-03-05 05:11:18 | 9999.897 |
| 2021-03-05 05:11:49 | 9999.897 |
| 2021-03-05 05:12:19 | 9999.897 |
| 2021-03-05 05:12:50 | 9999.897 |
| 2021-03-05 05:13:21 | 9999.898 |
| 2021-03-05 05:13:51 | 9999.898 |
| 2021-03-05 05:14:22 | 9999.898 |
| 2021-03-05 05:14:53 | 9999.898 |
| 2021-03-05 05:15:23 | 9999.898 |
| 2021-03-05 05:15:54 | 9999.898 |
| 2021-03-05 05:16:25 | 9999.898 |
| 2021-03-05 05:16:55 | 9999.898 |
| 2021-03-05 05:17:26 | 9999.898 |
| 2021-03-05 05:17:57 | 9999.898 |
| 2021-03-05 05:18:28 | 9999.898 |
| 2021-03-05 05:18:58 | 9999.898 |
| 2021-03-05 05:19:29 | 9999.898 |
| 2021-03-05 05:20:00 | 9999.898 |
| 2021-03-05 05:20:30 | 9999.898 |
| 2021-03-05 05:21:01 | 9999.898 |
| 2021-03-05 05:21:32 | 9999.898 |
| 2021-03-05 05:22:02 | 9999.898 |
| 2021-03-05 05:22:33 | 9999.898 |
| 2021-03-05 05:23:04 | 9999.898 |
| 2021-03-05 05:23:34 | 9999.898 |
| 2021-03-05 05:24:05 | 9999.897 |
| 2021-03-05 05:24:36 | 9999.897 |
| 2021-03-05 05:25:06 | 9999.897 |
| 2021-03-05 05:25:37 | 9999.897 |
| 2021-03-05 05:26:08 | 9999.898 |
| 2021-03-05 05:26:38 | 9999.898 |
| 2021-03-05 05:27:09 | 9999.898 |
| 2021-03-05 05:27:40 | 9999.898 |
| 2021-03-05 05:28:10 | 9999.898 |
| 2021-03-05 05:28:41 | 9999.898 |
| 2021-03-05 05:29:12 | 9999.897 |
| 2021-03-05 05:29:42 | 9999.897 |
| 2021-03-05 05:30:13 | 9999.897 |
| 2021-03-05 05:30:44 | 9999.897 |
| 2021-03-05 05:31:14 | 9999.897 |
| 2021-03-05 05:31:45 | 9999.897 |
| 2021-03-05 05:32:16 | 9999.897 |
| 2021-03-05 05:32:47 | 9999.897 |
| 2021-03-05 05:33:17 | 9999.897 |
| 2021-03-05 05:33:48 | 9999.897 |
| 2021-03-05 05:34:19 | 9999.897 |
| 2021-03-05 05:34:49 | 9999.897 |
| 2021-03-05 05:35:20 | 9999.897 |
| 2021-03-05 05:35:51 | 9999.897 |
| 2021-03-05 05:36:21 | 9999.897 |
| 2021-03-05 05:36:52 | 9999.897 |
| 2021-03-05 05:37:23 | 9999.897 |
| 2021-03-05 05:37:53 | 9999.897 |
| 2021-03-05 05:38:24 | 9999.897 |
| 2021-03-05 05:38:55 | 9999.897 |
| 2021-03-05 05:39:25 | 9999.897 |
| 2021-03-05 05:39:56 | 9999.897 |
| 2021-03-05 05:40:27 | 9999.897 |
| 2021-03-05 05:40:57 | 9999.897 |
| 2021-03-05 05:41:28 | 9999.897 |
| 2021-03-05 05:41:59 | 9999.897 |
| 2021-03-05 05:42:29 | 9999.897 |
| 2021-03-05 05:43:00 | 9999.897 |
| 2021-03-05 05:43:31 | 9999.897 |
| 2021-03-05 05:44:01 | 9999.897 |
| 2021-03-05 05:44:32 | 9999.897 |
| 2021-03-05 05:45:03 | 9999.897 |
| 2021-03-05 05:45:33 | 9999.897 |
| 2021-03-05 05:46:04 | 9999.897 |
| 2021-03-05 05:46:35 | 9999.897 |
| 2021-03-05 05:47:05 | 9999.897 |
| 2021-03-05 05:47:36 | 9999.897 |
| 2021-03-05 05:48:07 | 9999.897 |
| 2021-03-05 05:48:38 | 9999.897 |
| 2021-03-05 05:49:08 | 9999.897 |
| 2021-03-05 05:49:39 | 9999.897 |
| 2021-03-05 05:50:10 | 9999.897 |
| 2021-03-05 05:50:40 | 9999.897 |
| 2021-03-05 05:51:11 | 9999.897 |
| 2021-03-05 05:51:42 | 9999.897 |
| 2021-03-05 05:52:12 | 9999.897 |
| 2021-03-05 05:52:43 | 9999.897 |
| 2021-03-05 05:53:14 | 9999.897 |
| 2021-03-05 05:53:44 | 9999.897 |
| 2021-03-05 05:54:15 | 9999.897 |
| 2021-03-05 05:54:46 | 9999.897 |
| 2021-03-05 05:55:16 | 9999.897 |
| 2021-03-05 05:55:47 | 9999.897 |
| 2021-03-05 05:56:18 | 9999.897 |
| 2021-03-05 05:56:48 | 9999.897 |
| 2021-03-05 05:57:19 | 9999.897 |
| 2021-03-05 05:57:50 | 9999.897 |
| 2021-03-05 05:58:20 | 9999.897 |
| 2021-03-05 05:58:51 | 9999.897 |
| 2021-03-05 05:59:22 | 9999.897 |
| 2021-03-05 05:59:52 | 9999.897 |
| 2021-03-05 06:00:23 | 9999.897 |
| 2021-03-05 06:00:54 | 9999.897 |
| 2021-03-05 06:01:25 | 9999.897 |
| 2021-03-05 06:01:55 | 9999.897 |
| 2021-03-05 06:02:26 | 9999.897 |
| 2021-03-05 06:02:57 | 9999.897 |
| 2021-03-05 06:03:27 | 9999.897 |
| 2021-03-05 06:03:58 | 9999.897 |
| 2021-03-05 06:04:29 | 9999.897 |
| 2021-03-05 06:04:59 | 9999.897 |
| 2021-03-05 06:05:30 | 9999.897 |
| 2021-03-05 06:06:01 | 9999.897 |
| 2021-03-05 06:06:31 | 9999.897 |
| 2021-03-05 06:07:02 | 9999.897 |
| 2021-03-05 06:07:33 | 9999.897 |
| 2021-03-05 06:08:03 | 9999.897 |
| 2021-03-05 06:08:34 | 9999.897 |
| 2021-03-05 06:09:05 | 9999.897 |
| 2021-03-05 06:09:35 | 9999.897 |
| 2021-03-05 06:10:06 | 9999.897 |
| 2021-03-05 06:10:37 | 9999.897 |
| 2021-03-05 06:11:07 | 9999.897 |
| 2021-03-05 06:11:38 | 9999.897 |
| 2021-03-05 06:12:09 | 9999.897 |
| 2021-03-05 06:12:39 | 9999.897 |
| 2021-03-05 06:13:10 | 9999.897 |
| 2021-03-05 06:13:41 | 9999.897 |
| 2021-03-05 06:14:11 | 9999.897 |
| 2021-03-05 06:14:42 | 9999.897 |
| 2021-03-05 06:15:13 | 9999.897 |
| 2021-03-05 06:15:44 | 9999.897 |
| 2021-03-05 06:16:14 | 9999.897 |
| 2021-03-05 06:16:45 | 9999.897 |
| 2021-03-05 06:17:16 | 9999.897 |
| 2021-03-05 06:17:46 | 9999.897 |
| 2021-03-05 06:18:17 | 9999.897 |
| 2021-03-05 06:18:48 | 9999.897 |
| 2021-03-05 06:19:18 | 9999.897 |
| 2021-03-05 06:19:49 | 9999.897 |
| 2021-03-05 06:20:20 | 9999.897 |
| 2021-03-05 06:20:50 | 9999.897 |
| 2021-03-05 06:21:21 | 9999.897 |
| 2021-03-05 06:21:52 | 9999.897 |
| 2021-03-05 06:22:22 | 9999.897 |
| 2021-03-05 06:22:53 | 9999.897 |
| 2021-03-05 06:23:24 | 9999.897 |
| 2021-03-05 06:23:54 | 9999.897 |
| 2021-03-05 06:24:25 | 9999.897 |
| 2021-03-05 06:24:56 | 9999.897 |
| 2021-03-05 06:25:26 | 9999.897 |
| 2021-03-05 06:25:57 | 9999.897 |
| 2021-03-05 06:26:28 | 9999.897 |
| 2021-03-05 06:26:58 | 9999.897 |
| 2021-03-05 06:27:29 | 9999.897 |
| 2021-03-05 06:28:00 | 9999.897 |
| 2021-03-05 06:28:31 | 9999.897 |
| 2021-03-05 06:29:01 | 9999.897 |
| 2021-03-05 06:29:32 | 9999.897 |
| 2021-03-05 06:30:03 | 9999.897 |
| 2021-03-05 06:30:33 | 9999.897 |
| 2021-03-05 06:31:04 | 9999.897 |
| 2021-03-05 06:31:35 | 9999.897 |
| 2021-03-05 06:32:05 | 9999.897 |
| 2021-03-05 06:32:36 | 9999.897 |
| 2021-03-05 06:33:07 | 9999.897 |
| 2021-03-05 06:33:37 | 9999.897 |
| 2021-03-05 06:34:08 | 9999.897 |
| 2021-03-05 06:34:39 | 9999.897 |
| 2021-03-05 06:35:09 | 9999.897 |
| 2021-03-05 06:35:40 | 9999.897 |
| 2021-03-05 06:36:11 | 9999.897 |
| 2021-03-05 06:36:41 | 9999.897 |
| 2021-03-05 06:37:12 | 9999.897 |
| 2021-03-05 06:37:43 | 9999.897 |
| 2021-03-05 06:38:13 | 9999.897 |
| 2021-03-05 06:38:44 | 9999.897 |
| 2021-03-05 06:39:15 | 9999.897 |
| 2021-03-05 06:39:45 | 9999.897 |
| 2021-03-05 06:40:16 | 9999.897 |
| 2021-03-05 06:40:47 | 9999.897 |
| 2021-03-05 06:41:18 | 9999.897 |
| 2021-03-05 06:41:48 | 9999.897 |
| 2021-03-05 06:42:19 | 9999.897 |
| 2021-03-05 06:42:50 | 9999.897 |
| 2021-03-05 06:43:20 | 9999.897 |
| 2021-03-05 06:43:51 | 9999.897 |
| 2021-03-05 06:44:22 | 9999.897 |
| 2021-03-05 06:44:52 | 9999.897 |
| 2021-03-05 06:45:23 | 9999.897 |
| 2021-03-05 06:45:54 | 9999.897 |
| 2021-03-05 06:46:24 | 9999.897 |
| 2021-03-05 06:46:55 | 9999.897 |
| 2021-03-05 06:47:26 | 9999.897 |
| 2021-03-05 06:47:56 | 9999.897 |
| 2021-03-05 06:48:27 | 9999.897 |
| 2021-03-05 06:48:58 | 9999.897 |
| 2021-03-05 06:49:28 | 9999.897 |
| 2021-03-05 06:49:59 | 9999.897 |
| 2021-03-05 06:50:30 | 9999.897 |
| 2021-03-05 06:51:00 | 9999.897 |
| 2021-03-05 06:51:31 | 9999.897 |
| 2021-03-05 06:52:02 | 9999.897 |
| 2021-03-05 06:52:32 | 9999.897 |
| 2021-03-05 06:53:03 | 9999.897 |
| 2021-03-05 06:53:34 | 9999.897 |
| 2021-03-05 06:54:05 | 9999.897 |
| 2021-03-05 06:54:35 | 9999.897 |
| 2021-03-05 06:55:06 | 9999.897 |
| 2021-03-05 06:55:37 | 9999.897 |
| 2021-03-05 06:56:07 | 9999.897 |
| 2021-03-05 06:56:38 | 9999.897 |
| 2021-03-05 06:57:09 | 9999.897 |
| 2021-03-05 06:57:39 | 9999.897 |
| 2021-03-05 06:58:10 | 9999.897 |
| 2021-03-05 06:58:41 | 9999.897 |
| 2021-03-05 06:59:11 | 9999.897 |
| 2021-03-05 06:59:42 | 9999.897 |
| 2021-03-05 07:00:13 | 9999.897 |
| 2021-03-05 07:00:43 | 9999.897 |
| 2021-03-05 07:01:14 | 9999.897 |
| 2021-03-05 07:01:45 | 9999.897 |
| 2021-03-05 07:02:15 | 9999.897 |
| 2021-03-05 07:02:46 | 9999.897 |
| 2021-03-05 07:03:17 | 9999.897 |
| 2021-03-05 07:03:47 | 9999.897 |
| 2021-03-05 07:04:18 | 9999.897 |
| 2021-03-05 07:04:49 | 9999.897 |
| 2021-03-05 07:05:20 | 9999.897 |
| 2021-03-05 07:05:50 | 9999.897 |
| 2021-03-05 07:06:21 | 9999.897 |
| 2021-03-05 07:06:52 | 9999.897 |
| 2021-03-05 07:07:22 | 9999.897 |
| 2021-03-05 07:07:53 | 9999.897 |
| 2021-03-05 07:08:24 | 9999.897 |
| 2021-03-05 07:08:54 | 9999.897 |
| 2021-03-05 07:09:25 | 9999.897 |
| 2021-03-05 07:09:56 | 9999.897 |
| 2021-03-05 07:10:26 | 9999.897 |
| 2021-03-05 07:10:57 | 9999.897 |
| 2021-03-05 07:11:28 | 9999.897 |
| 2021-03-05 07:11:58 | 9999.897 |
| 2021-03-05 07:12:29 | 9999.897 |
| 2021-03-05 07:13:00 | 9999.897 |
| 2021-03-05 07:13:30 | 9999.897 |
| 2021-03-05 07:14:01 | 9999.897 |
| 2021-03-05 07:14:32 | 9999.897 |
| 2021-03-05 07:15:02 | 9999.897 |
| 2021-03-05 07:15:33 | 9999.897 |
| 2021-03-05 07:16:04 | 9999.897 |
| 2021-03-05 07:16:34 | 9999.897 |
| 2021-03-05 07:17:05 | 9999.897 |
| 2021-03-05 07:17:36 | 9999.897 |
| 2021-03-05 07:18:06 | 9999.897 |
| 2021-03-05 07:18:37 | 9999.897 |
| 2021-03-05 07:19:08 | 9999.897 |
| 2021-03-05 07:19:38 | 9999.897 |
| 2021-03-05 07:20:09 | 9999.897 |
| 2021-03-05 07:20:40 | 9999.897 |
| 2021-03-05 07:21:11 | 9999.897 |
| 2021-03-05 07:21:41 | 9999.897 |
| 2021-03-05 07:22:12 | 9999.897 |
| 2021-03-05 07:22:43 | 9999.897 |
| 2021-03-05 07:23:13 | 9999.897 |
| 2021-03-05 07:23:44 | 9999.897 |
| 2021-03-05 07:24:15 | 9999.897 |
| 2021-03-05 07:24:45 | 9999.897 |
| 2021-03-05 07:25:16 | 9999.897 |
| 2021-03-05 07:25:47 | 9999.897 |
| 2021-03-05 07:26:17 | 9999.897 |
| 2021-03-05 07:26:48 | 9999.897 |
| 2021-03-05 07:27:19 | 9999.897 |
| 2021-03-05 07:27:49 | 9999.897 |
| 2021-03-05 07:28:20 | 9999.897 |
| 2021-03-05 07:28:51 | 9999.897 |
| 2021-03-05 07:29:21 | 9999.897 |
| 2021-03-05 07:29:52 | 9999.897 |
| 2021-03-05 07:30:23 | 9999.897 |
| 2021-03-05 07:30:53 | 9999.897 |
| 2021-03-05 07:31:24 | 9999.897 |
| 2021-03-05 07:31:55 | 9999.897 |
| 2021-03-05 07:32:26 | 9999.897 |
| 2021-03-05 07:32:56 | 9999.897 |
| 2021-03-05 07:33:27 | 9999.897 |
| 2021-03-05 07:33:58 | 9999.897 |
| 2021-03-05 07:34:28 | 9999.897 |
| 2021-03-05 07:34:59 | 9999.897 |
| 2021-03-05 07:35:30 | 9999.897 |
| 2021-03-05 07:36:00 | 9999.897 |
| 2021-03-05 07:36:31 | 9999.897 |
| 2021-03-05 07:37:02 | 9999.897 |
| 2021-03-05 07:37:32 | 9999.897 |
| 2021-03-05 07:38:03 | 9999.897 |
| 2021-03-05 07:38:34 | 9999.897 |
| 2021-03-05 07:39:04 | 9999.897 |
| 2021-03-05 07:39:35 | 9999.897 |
| 2021-03-05 07:40:06 | 9999.897 |
| 2021-03-05 07:40:36 | 9999.897 |
| 2021-03-05 07:41:07 | 9999.897 |
| 2021-03-05 07:41:38 | 9999.897 |
| 2021-03-05 07:42:08 | 9999.897 |
| 2021-03-05 07:42:39 | 9999.897 |
| 2021-03-05 07:43:10 | 9999.897 |
| 2021-03-05 07:43:40 | 9999.897 |
| 2021-03-05 07:44:11 | 9999.897 |
| 2021-03-05 07:44:42 | 9999.897 |
| 2021-03-05 07:45:13 | 9999.897 |
| 2021-03-05 07:45:43 | 9999.897 |
| 2021-03-05 07:46:14 | 9999.897 |
| 2021-03-05 07:46:45 | 9999.897 |
| 2021-03-05 07:47:15 | 9999.897 |
| 2021-03-05 07:47:46 | 9999.897 |
| 2021-03-05 07:48:17 | 9999.897 |
| 2021-03-05 07:48:47 | 9999.898 |
| 2021-03-05 07:49:18 | 9999.898 |
| 2021-03-05 07:49:49 | 9999.897 |
| 2021-03-05 07:50:19 | 9999.897 |
| 2021-03-05 07:50:50 | 9999.898 |
| 2021-03-05 07:51:21 | 9999.898 |
| 2021-03-05 07:51:51 | 9999.898 |
| 2021-03-05 07:52:22 | 9999.897 |
| 2021-03-05 07:52:53 | 9999.897 |
| 2021-03-05 07:53:23 | 9999.897 |
| 2021-03-05 07:53:54 | 9999.897 |
| 2021-03-05 07:54:25 | 9999.897 |
| 2021-03-05 07:54:55 | 9999.897 |
| 2021-03-05 07:55:26 | 9999.897 |
| 2021-03-05 07:55:57 | 9999.897 |
| 2021-03-05 07:56:28 | 9999.897 |
| 2021-03-05 07:56:58 | 9999.897 |
| 2021-03-05 07:57:29 | 9999.897 |
| 2021-03-05 07:58:00 | 9999.897 |
| 2021-03-05 07:58:30 | 9999.897 |
| 2021-03-05 07:59:01 | 9999.897 |
| 2021-03-05 07:59:32 | 9999.897 |
| 2021-03-05 08:00:02 | 9999.897 |
| 2021-03-05 08:00:33 | 9999.897 |
| 2021-03-05 08:01:04 | 9999.897 |
| 2021-03-05 08:01:34 | 9999.897 |
| 2021-03-05 08:02:05 | 9999.897 |
| 2021-03-05 08:02:36 | 9999.897 |
| 2021-03-05 08:03:06 | 9999.897 |
| 2021-03-05 08:03:37 | 9999.897 |
| 2021-03-05 08:04:08 | 9999.897 |
| 2021-03-05 08:04:38 | 9999.897 |
| 2021-03-05 08:05:09 | 9999.897 |
| 2021-03-05 08:05:40 | 9999.897 |
| 2021-03-05 08:06:10 | 9999.897 |
| 2021-03-05 08:06:41 | 9999.897 |
| 2021-03-05 08:07:12 | 9999.897 |
| 2021-03-05 08:07:43 | 9999.897 |
| 2021-03-05 08:08:13 | 9999.897 |
| 2021-03-05 08:08:44 | 9999.897 |
| 2021-03-05 08:09:15 | 9999.897 |
| 2021-03-05 08:09:45 | 9999.897 |
| 2021-03-05 08:10:16 | 9999.897 |
| 2021-03-05 08:10:47 | 9999.897 |
| 2021-03-05 08:11:17 | 9999.897 |
| 2021-03-05 08:11:48 | 9999.897 |
| 2021-03-05 08:12:19 | 9999.897 |
| 2021-03-05 08:12:49 | 9999.897 |
| 2021-03-05 08:13:20 | 9999.897 |
| 2021-03-05 08:13:51 | 9999.897 |
| 2021-03-05 08:14:21 | 9999.897 |
| 2021-03-05 08:14:52 | 9999.897 |
| 2021-03-05 08:15:23 | 9999.897 |
| 2021-03-05 08:15:53 | 9999.897 |
| 2021-03-05 08:16:24 | 9999.897 |
| 2021-03-05 08:16:55 | 9999.897 |
| 2021-03-05 08:17:25 | 9999.897 |
| 2021-03-05 08:17:56 | 9999.897 |
| 2021-03-05 08:18:27 | 9999.897 |
| 2021-03-05 08:18:57 | 9999.897 |
| 2021-03-05 08:19:28 | 9999.897 |
| 2021-03-05 08:19:59 | 9999.897 |
| 2021-03-05 08:20:29 | 9999.897 |
| 2021-03-05 08:21:00 | 9999.897 |
| 2021-03-05 08:21:31 | 9999.897 |
| 2021-03-05 08:22:02 | 9999.897 |
| 2021-03-05 08:22:32 | 9999.897 |
| 2021-03-05 08:23:03 | 9999.897 |
| 2021-03-05 08:23:34 | 9999.897 |
| 2021-03-05 08:24:04 | 9999.897 |
| 2021-03-05 08:24:35 | 9999.897 |
| 2021-03-05 08:25:06 | 9999.897 |
| 2021-03-05 08:25:36 | 9999.897 |
| 2021-03-05 08:26:07 | 9999.897 |
| 2021-03-05 08:26:38 | 9999.897 |
| 2021-03-05 08:27:08 | 9999.897 |
| 2021-03-05 08:27:39 | 9999.897 |
| 2021-03-05 08:28:10 | 9999.897 |
| 2021-03-05 08:28:40 | 9999.897 |
| 2021-03-05 08:29:11 | 9999.897 |
| 2021-03-05 08:29:42 | 9999.897 |
| 2021-03-05 08:30:12 | 9999.897 |
| 2021-03-05 08:30:43 | 9999.897 |
| 2021-03-05 08:31:14 | 9999.897 |
| 2021-03-05 08:31:44 | 9999.897 |
| 2021-03-05 08:32:15 | 9999.897 |
| 2021-03-05 08:32:46 | 9999.897 |
| 2021-03-05 08:33:16 | 9999.897 |
| 2021-03-05 08:33:47 | 9999.897 |
| 2021-03-05 08:34:18 | 9999.897 |
| 2021-03-05 08:34:49 | 9999.897 |
| 2021-03-05 08:35:19 | 9999.897 |
| 2021-03-05 08:35:50 | 9999.897 |
| 2021-03-05 08:36:21 | 9999.897 |
| 2021-03-05 08:36:51 | 9999.897 |
| 2021-03-05 08:37:22 | 9999.897 |
| 2021-03-05 08:37:53 | 9999.897 |
| 2021-03-05 08:38:23 | 9999.897 |
| 2021-03-05 08:38:54 | 9999.897 |
| 2021-03-05 08:39:25 | 9999.897 |
| 2021-03-05 08:39:55 | 9999.897 |
| 2021-03-05 08:40:26 | 9999.897 |
| 2021-03-05 08:40:57 | 9999.897 |
| 2021-03-05 08:41:27 | 9999.897 |
| 2021-03-05 08:41:58 | 9999.897 |
| 2021-03-05 08:42:29 | 9999.897 |
| 2021-03-05 08:42:59 | 9999.897 |
| 2021-03-05 08:43:30 | 9999.897 |
| 2021-03-05 08:44:01 | 9999.897 |
| 2021-03-05 08:44:31 | 9999.897 |
| 2021-03-05 08:45:02 | 9999.897 |
| 2021-03-05 08:45:33 | 9999.897 |
| 2021-03-05 08:46:03 | 9999.897 |
| 2021-03-05 08:46:34 | 9999.897 |
| 2021-03-05 08:47:05 | 9999.897 |
| 2021-03-05 08:47:35 | 9999.897 |
| 2021-03-05 08:48:06 | 9999.897 |
| 2021-03-05 08:48:37 | 9999.897 |
| 2021-03-05 08:49:08 | 9999.897 |
| 2021-03-05 08:49:38 | 9999.897 |
| 2021-03-05 08:50:09 | 9999.897 |
| 2021-03-05 08:50:40 | 9999.898 |
| 2021-03-05 08:51:10 | 9999.898 |
| 2021-03-05 08:51:41 | 9999.898 |
| 2021-03-05 08:52:12 | 9999.898 |
| 2021-03-05 08:52:42 | 9999.898 |
| 2021-03-05 08:53:13 | 9999.898 |
| 2021-03-05 08:53:44 | 9999.898 |
| 2021-03-05 08:54:14 | 9999.898 |
| 2021-03-05 08:54:45 | 9999.897 |
| 2021-03-05 08:55:16 | 9999.897 |
| 2021-03-05 08:55:46 | 9999.897 |
| 2021-03-05 08:56:17 | 9999.897 |
| 2021-03-05 08:56:48 | 9999.897 |
| 2021-03-05 08:57:18 | 9999.897 |
| 2021-03-05 08:57:49 | 9999.897 |
| 2021-03-05 08:58:20 | 9999.897 |
| 2021-03-05 08:58:50 | 9999.897 |
| 2021-03-05 08:59:21 | 9999.897 |
| 2021-03-05 08:59:52 | 9999.897 |
| 2021-03-05 09:00:22 | 9999.897 |
| 2021-03-05 09:00:53 | 9999.897 |
| 2021-03-05 09:01:24 | 9999.897 |
| 2021-03-05 09:01:55 | 9999.897 |
| 2021-03-05 09:02:25 | 9999.897 |
| 2021-03-05 09:02:56 | 9999.897 |
| 2021-03-05 09:03:27 | 9999.897 |
| 2021-03-05 09:03:57 | 9999.897 |
| 2021-03-05 09:04:28 | 9999.897 |
| 2021-03-05 09:04:59 | 9999.897 |
| 2021-03-05 09:05:29 | 9999.897 |
| 2021-03-05 09:06:00 | 9999.897 |
| 2021-03-05 09:06:31 | 9999.897 |
| 2021-03-05 09:07:01 | 9999.897 |
| 2021-03-05 09:07:32 | 9999.897 |
| 2021-03-05 09:08:03 | 9999.897 |
| 2021-03-05 09:08:33 | 9999.897 |
| 2021-03-05 09:09:04 | 9999.897 |
| 2021-03-05 09:09:35 | 9999.897 |
| 2021-03-05 09:10:05 | 9999.897 |
| 2021-03-05 09:10:36 | 9999.897 |
| 2021-03-05 09:11:07 | 9999.897 |
| 2021-03-05 09:11:37 | 9999.897 |
| 2021-03-05 09:12:08 | 9999.897 |
| 2021-03-05 09:12:39 | 9999.897 |
| 2021-03-05 09:13:09 | 9999.897 |
| 2021-03-05 09:13:40 | 9999.897 |
| 2021-03-05 09:14:11 | 9999.897 |
| 2021-03-05 09:14:42 | 9999.897 |
| 2021-03-05 09:15:12 | 9999.897 |
| 2021-03-05 09:15:43 | 9999.897 |
| 2021-03-05 09:16:14 | 9999.897 |
| 2021-03-05 09:16:44 | 9999.897 |
| 2021-03-05 09:17:15 | 9999.897 |
| 2021-03-05 09:17:46 | 9999.897 |
| 2021-03-05 09:18:16 | 9999.897 |
| 2021-03-05 09:18:47 | 9999.897 |
| 2021-03-05 09:19:18 | 9999.897 |
| 2021-03-05 09:19:48 | 9999.897 |
| 2021-03-05 09:20:19 | 9999.897 |
| 2021-03-05 09:20:50 | 9999.897 |
| 2021-03-05 09:21:20 | 9999.897 |
| 2021-03-05 09:21:51 | 9999.897 |
| 2021-03-05 09:22:22 | 9999.897 |
| 2021-03-05 09:22:52 | 9999.897 |
| 2021-03-05 09:23:23 | 9999.897 |
| 2021-03-05 09:23:54 | 9999.897 |
| 2021-03-05 09:24:24 | 9999.897 |
| 2021-03-05 09:24:55 | 9999.897 |
| 2021-03-05 09:25:26 | 9999.897 |
| 2021-03-05 09:25:56 | 9999.897 |
| 2021-03-05 09:26:27 | 9999.897 |
| 2021-03-05 09:26:58 | 9999.897 |
| 2021-03-05 09:27:29 | 9999.897 |
| 2021-03-05 09:27:59 | 9999.897 |
| 2021-03-05 09:28:30 | 9999.897 |
| 2021-03-05 09:29:01 | 9999.897 |
| 2021-03-05 09:29:31 | 9999.897 |
| 2021-03-05 09:30:02 | 9999.897 |
| 2021-03-05 09:30:33 | 9999.897 |
| 2021-03-05 09:31:03 | 9999.897 |
| 2021-03-05 09:31:34 | 9999.897 |
| 2021-03-05 09:32:05 | 9999.897 |
| 2021-03-05 09:32:35 | 9999.897 |
| 2021-03-05 09:33:06 | 9999.897 |
| 2021-03-05 09:33:37 | 9999.897 |
| 2021-03-05 09:34:07 | 9999.897 |
| 2021-03-05 09:34:38 | 9999.897 |
| 2021-03-05 09:35:09 | 9999.897 |
| 2021-03-05 09:35:39 | 9999.897 |
| 2021-03-05 09:36:10 | 9999.897 |
| 2021-03-05 09:36:41 | 9999.897 |
| 2021-03-05 09:37:12 | 9999.897 |
| 2021-03-05 09:37:42 | 9999.897 |
| 2021-03-05 09:38:13 | 9999.897 |
| 2021-03-05 09:38:44 | 9999.897 |
| 2021-03-05 09:39:14 | 9999.897 |
| 2021-03-05 09:39:45 | 9999.897 |
| 2021-03-05 09:40:16 | 9999.898 |
| 2021-03-05 09:40:46 | 9999.898 |
| 2021-03-05 09:41:17 | 9999.898 |
| 2021-03-05 09:41:48 | 9999.898 |
| 2021-03-05 09:42:18 | 9999.898 |
| 2021-03-05 09:42:49 | 9999.898 |
| 2021-03-05 09:43:20 | 9999.898 |
| 2021-03-05 09:43:50 | 9999.898 |
| 2021-03-05 09:44:21 | 9999.898 |
| 2021-03-05 09:44:52 | 9999.898 |
| 2021-03-05 09:45:22 | 9999.898 |
| 2021-03-05 09:45:53 | 9999.898 |
| 2021-03-05 09:46:24 | 9999.898 |
| 2021-03-05 09:46:54 | 9999.898 |
| 2021-03-05 09:47:25 | 9999.898 |
| 2021-03-05 09:47:56 | 9999.898 |
| 2021-03-05 09:48:26 | 9999.898 |
| 2021-03-05 09:48:57 | 9999.898 |
| 2021-03-05 09:49:28 | 9999.898 |
| 2021-03-05 09:49:59 | 9999.898 |
| 2021-03-05 09:50:29 | 9999.898 |
| 2021-03-05 09:51:00 | 9999.898 |
| 2021-03-05 09:51:31 | 9999.898 |
| 2021-03-05 09:52:01 | 9999.897 |
| 2021-03-05 09:52:32 | 9999.897 |
| 2021-03-05 09:53:03 | 9999.897 |
| 2021-03-05 09:53:33 | 9999.897 |
| 2021-03-05 09:54:04 | 9999.897 |
| 2021-03-05 09:54:35 | 9999.897 |
| 2021-03-05 09:55:05 | 9999.897 |
| 2021-03-05 09:55:36 | 9999.897 |
| 2021-03-05 09:56:07 | 9999.897 |
| 2021-03-05 09:56:37 | 9999.897 |
| 2021-03-05 09:57:08 | 9999.898 |
| 2021-03-05 09:57:39 | 9999.898 |
| 2021-03-05 09:58:09 | 9999.898 |
| 2021-03-05 09:58:40 | 9999.898 |
| 2021-03-05 09:59:11 | 9999.898 |
| 2021-03-05 09:59:41 | 9999.898 |
| 2021-03-05 10:00:12 | 9999.898 |
| 2021-03-05 10:00:43 | 9999.898 |
| 2021-03-05 10:01:14 | 9999.898 |
| 2021-03-05 10:01:44 | 9999.898 |
| 2021-03-05 10:02:15 | 9999.898 |
| 2021-03-05 10:02:46 | 9999.898 |
| 2021-03-05 10:03:16 | 9999.898 |
| 2021-03-05 10:03:47 | 9999.898 |
| 2021-03-05 10:04:18 | 9999.898 |
| 2021-03-05 10:04:48 | 9999.898 |
| 2021-03-05 10:05:19 | 9999.898 |
| 2021-03-05 10:05:50 | 9999.898 |
| 2021-03-05 10:06:20 | 9999.898 |
| 2021-03-05 10:06:51 | 9999.898 |
| 2021-03-05 10:07:22 | 9999.898 |
| 2021-03-05 10:07:52 | 9999.898 |
| 2021-03-05 10:08:23 | 9999.898 |
| 2021-03-05 10:08:54 | 9999.898 |
| 2021-03-05 10:09:24 | 9999.898 |
| 2021-03-05 10:09:55 | 9999.898 |
| 2021-03-05 10:10:26 | 9999.897 |
| 2021-03-05 10:10:56 | 9999.897 |
| 2021-03-05 10:11:27 | 9999.897 |
| 2021-03-05 10:11:58 | 9999.897 |
| 2021-03-05 10:12:28 | 9999.897 |
| 2021-03-05 10:12:59 | 9999.898 |
| 2021-03-05 10:13:30 | 9999.897 |
| 2021-03-05 10:14:01 | 9999.897 |
| 2021-03-05 10:14:31 | 9999.897 |
| 2021-03-05 10:15:02 | 9999.897 |
| 2021-03-05 10:15:33 | 9999.897 |
| 2021-03-05 10:16:03 | 9999.897 |
| 2021-03-05 10:16:34 | 9999.897 |
| 2021-03-05 10:17:05 | 9999.897 |
| 2021-03-05 10:17:35 | 9999.897 |
| 2021-03-05 10:18:06 | 9999.897 |
| 2021-03-05 10:18:37 | 9999.897 |
| 2021-03-05 10:19:07 | 9999.897 |
| 2021-03-05 10:19:38 | 9999.897 |
| 2021-03-05 10:20:09 | 9999.897 |
| 2021-03-05 10:20:39 | 9999.897 |
| 2021-03-05 10:21:10 | 9999.897 |
| 2021-03-05 10:21:41 | 9999.897 |
| 2021-03-05 10:22:11 | 9999.897 |
| 2021-03-05 10:22:42 | 9999.897 |
| 2021-03-05 10:23:13 | 9999.897 |
| 2021-03-05 10:23:43 | 9999.897 |
| 2021-03-05 10:24:14 | 9999.897 |
| 2021-03-05 10:24:45 | 9999.897 |
| 2021-03-05 10:25:15 | 9999.897 |
| 2021-03-05 10:25:46 | 9999.897 |
| 2021-03-05 10:26:17 | 9999.897 |
| 2021-03-05 10:26:48 | 9999.897 |
| 2021-03-05 10:27:18 | 9999.897 |
| 2021-03-05 10:27:49 | 9999.897 |
| 2021-03-05 10:28:20 | 9999.897 |
| 2021-03-05 10:28:50 | 9999.897 |
| 2021-03-05 10:29:21 | 9999.897 |
| 2021-03-05 10:29:52 | 9999.897 |
| 2021-03-05 10:30:22 | 9999.897 |
| 2021-03-05 10:30:53 | 9999.897 |
| 2021-03-05 10:31:24 | 9999.897 |
| 2021-03-05 10:31:54 | 9999.897 |
| 2021-03-05 10:32:25 | 9999.897 |
| 2021-03-05 10:32:56 | 9999.898 |
| 2021-03-05 10:33:26 | 9999.898 |
| 2021-03-05 10:33:57 | 9999.898 |
| 2021-03-05 10:34:28 | 9999.898 |
| 2021-03-05 10:34:58 | 9999.898 |
| 2021-03-05 10:35:29 | 9999.897 |
| 2021-03-05 10:36:00 | 9999.897 |
| 2021-03-05 10:36:30 | 9999.897 |
| 2021-03-05 10:37:01 | 9999.897 |
| 2021-03-05 10:37:32 | 9999.897 |
| 2021-03-05 10:38:02 | 9999.897 |
| 2021-03-05 10:38:33 | 9999.897 |
| 2021-03-05 10:39:04 | 9999.897 |
| 2021-03-05 10:39:35 | 9999.897 |
| 2021-03-05 10:40:05 | 9999.897 |
| 2021-03-05 10:40:36 | 9999.897 |
| 2021-03-05 10:41:07 | 9999.897 |
| 2021-03-05 10:41:37 | 9999.897 |
| 2021-03-05 10:42:08 | 9999.897 |
| 2021-03-05 10:42:39 | 9999.897 |
| 2021-03-05 10:43:09 | 9999.897 |
| 2021-03-05 10:43:40 | 9999.897 |
| 2021-03-05 10:44:11 | 9999.897 |
| 2021-03-05 10:44:41 | 9999.897 |
| 2021-03-05 10:45:12 | 9999.897 |
| 2021-03-05 10:45:43 | 9999.897 |
| 2021-03-05 10:46:13 | 9999.897 |
| 2021-03-05 10:46:44 | 9999.897 |
| 2021-03-05 10:47:15 | 9999.897 |
| 2021-03-05 10:47:45 | 9999.897 |
| 2021-03-05 10:48:16 | 9999.897 |
| 2021-03-05 10:48:47 | 9999.897 |
| 2021-03-05 10:49:17 | 9999.897 |
| 2021-03-05 10:49:48 | 9999.897 |
| 2021-03-05 10:50:19 | 9999.897 |
| 2021-03-05 10:50:49 | 9999.897 |
| 2021-03-05 10:51:20 | 9999.897 |
| 2021-03-05 10:51:51 | 9999.897 |
| 2021-03-05 10:52:22 | 9999.897 |
| 2021-03-05 10:52:52 | 9999.897 |
| 2021-03-05 10:53:23 | 9999.897 |
| 2021-03-05 10:53:54 | 9999.897 |
| 2021-03-05 10:54:24 | 9999.897 |
| 2021-03-05 10:54:55 | 9999.897 |
| 2021-03-05 10:55:26 | 9999.897 |
| 2021-03-05 10:55:56 | 9999.897 |
| 2021-03-05 10:56:27 | 9999.897 |
| 2021-03-05 10:56:58 | 9999.897 |
| 2021-03-05 10:57:28 | 9999.897 |
| 2021-03-05 10:57:59 | 9999.897 |
| 2021-03-05 10:58:30 | 9999.897 |
| 2021-03-05 10:59:00 | 9999.897 |
| 2021-03-05 10:59:31 | 9999.897 |
| 2021-03-05 11:00:02 | 9999.897 |
| 2021-03-05 11:00:32 | 9999.897 |
| 2021-03-05 11:01:03 | 9999.897 |
| 2021-03-05 11:01:34 | 9999.897 |
| 2021-03-05 11:02:04 | 9999.897 |
| 2021-03-05 11:02:35 | 9999.897 |
| 2021-03-05 11:03:06 | 9999.897 |
| 2021-03-05 11:03:37 | 9999.897 |
| 2021-03-05 11:04:07 | 9999.897 |
| 2021-03-05 11:04:38 | 9999.897 |
| 2021-03-05 11:05:09 | 9999.897 |
| 2021-03-05 11:05:39 | 9999.897 |
| 2021-03-05 11:06:10 | 9999.897 |
| 2021-03-05 11:06:41 | 9999.897 |
| 2021-03-05 11:07:11 | 9999.897 |
| 2021-03-05 11:07:42 | 9999.897 |
| 2021-03-05 11:08:13 | 9999.897 |
| 2021-03-05 11:08:43 | 9999.897 |
| 2021-03-05 11:09:14 | 9999.897 |
| 2021-03-05 11:09:45 | 9999.897 |
| 2021-03-05 11:10:15 | 9999.897 |
| 2021-03-05 11:10:46 | 9999.897 |
| 2021-03-05 11:11:17 | 9999.897 |
| 2021-03-05 11:11:47 | 9999.897 |
| 2021-03-05 11:12:18 | 9999.897 |
| 2021-03-05 11:12:49 | 9999.897 |
| 2021-03-05 11:13:19 | 9999.897 |
| 2021-03-05 11:13:50 | 9999.897 |
| 2021-03-05 11:14:21 | 9999.897 |
| 2021-03-05 11:14:51 | 9999.897 |
| 2021-03-05 11:15:22 | 9999.897 |
| 2021-03-05 11:15:53 | 9999.897 |
| 2021-03-05 11:16:24 | 9999.897 |
| 2021-03-05 11:16:54 | 9999.897 |
| 2021-03-05 11:17:25 | 9999.897 |
| 2021-03-05 11:17:56 | 9999.897 |
| 2021-03-05 11:18:26 | 9999.897 |
| 2021-03-05 11:18:57 | 9999.897 |
| 2021-03-05 11:19:28 | 9999.897 |
| 2021-03-05 11:19:58 | 9999.897 |
| 2021-03-05 11:20:29 | 9999.897 |
| 2021-03-05 11:21:00 | 9999.897 |
| 2021-03-05 11:21:30 | 9999.897 |
| 2021-03-05 11:22:01 | 9999.897 |
| 2021-03-05 11:22:32 | 9999.897 |
| 2021-03-05 11:23:02 | 9999.897 |
| 2021-03-05 11:23:33 | 9999.897 |
| 2021-03-05 11:24:04 | 9999.897 |
| 2021-03-05 11:24:34 | 9999.897 |
| 2021-03-05 11:25:05 | 9999.897 |
| 2021-03-05 11:25:36 | 9999.897 |
| 2021-03-05 11:26:06 | 9999.897 |
| 2021-03-05 11:26:37 | 9999.897 |
| 2021-03-05 11:27:08 | 9999.897 |
| 2021-03-05 11:27:38 | 9999.897 |
| 2021-03-05 11:28:09 | 9999.898 |
| 2021-03-05 11:28:40 | 9999.898 |
| 2021-03-05 11:29:11 | 9999.898 |
| 2021-03-05 11:29:41 | 9999.897 |
| 2021-03-05 11:30:12 | 9999.897 |
| 2021-03-05 11:30:43 | 9999.897 |
| 2021-03-05 11:31:13 | 9999.897 |
| 2021-03-05 11:31:44 | 9999.897 |
| 2021-03-05 11:32:15 | 9999.897 |
| 2021-03-05 11:32:45 | 9999.897 |
| 2021-03-05 11:33:16 | 9999.897 |
| 2021-03-05 11:33:47 | 9999.897 |
| 2021-03-05 11:34:17 | 9999.897 |
| 2021-03-05 11:34:48 | 9999.897 |
| 2021-03-05 11:35:19 | 9999.897 |
| 2021-03-05 11:35:49 | 9999.897 |
| 2021-03-05 11:36:20 | 9999.897 |
| 2021-03-05 11:36:51 | 9999.897 |
| 2021-03-05 11:37:21 | 9999.897 |
| 2021-03-05 11:37:52 | 9999.897 |
| 2021-03-05 11:38:23 | 9999.897 |
| 2021-03-05 11:38:53 | 9999.897 |
| 2021-03-05 11:39:24 | 9999.897 |
| 2021-03-05 11:39:55 | 9999.897 |
| 2021-03-05 11:40:25 | 9999.897 |
| 2021-03-05 11:40:56 | 9999.897 |
| 2021-03-05 11:41:27 | 9999.897 |
| 2021-03-05 11:41:58 | 9999.897 |
| 2021-03-05 11:42:28 | 9999.897 |
| 2021-03-05 11:42:59 | 9999.897 |
| 2021-03-05 11:43:30 | 9999.897 |
| 2021-03-05 11:44:00 | 9999.897 |
| 2021-03-05 11:44:31 | 9999.897 |
| 2021-03-05 11:45:02 | 9999.897 |
| 2021-03-05 11:45:32 | 9999.897 |
| 2021-03-05 11:46:03 | 9999.897 |
| 2021-03-05 11:46:34 | 9999.897 |
| 2021-03-05 11:47:04 | 9999.897 |
| 2021-03-05 11:47:35 | 9999.897 |
| 2021-03-05 11:48:06 | 9999.897 |
| 2021-03-05 11:48:36 | 9999.897 |
| 2021-03-05 11:49:07 | 9999.897 |
| 2021-03-05 11:49:38 | 9999.897 |
| 2021-03-05 11:50:08 | 9999.897 |
| 2021-03-05 11:50:39 | 9999.897 |
| 2021-03-05 11:51:10 | 9999.897 |
| 2021-03-05 11:51:40 | 9999.897 |
| 2021-03-05 11:52:11 | 9999.897 |
| 2021-03-05 11:52:42 | 9999.897 |
| 2021-03-05 11:53:13 | 9999.897 |
| 2021-03-05 11:53:43 | 9999.897 |
| 2021-03-05 11:54:14 | 9999.897 |
| 2021-03-05 11:54:45 | 9999.897 |
| 2021-03-05 11:55:15 | 9999.897 |
| 2021-03-05 11:55:46 | 9999.897 |
| 2021-03-05 11:56:17 | 9999.897 |
| 2021-03-05 11:56:47 | 9999.897 |
| 2021-03-05 11:57:18 | 9999.897 |
| 2021-03-05 11:57:49 | 9999.897 |
| 2021-03-05 11:58:19 | 9999.897 |
| 2021-03-05 11:58:50 | 9999.897 |
| 2021-03-05 11:59:21 | 9999.897 |
| 2021-03-05 11:59:51 | 9999.897 |
| 2021-03-05 12:00:22 | 9999.897 |
| 2021-03-05 12:00:53 | 9999.897 |
| 2021-03-05 12:01:23 | 9999.897 |
| 2021-03-05 12:01:54 | 9999.897 |
| 2021-03-05 12:02:25 | 9999.897 |
| 2021-03-05 12:02:55 | 9999.897 |
| 2021-03-05 12:03:26 | 9999.897 |
| 2021-03-05 12:03:57 | 9999.897 |
| 2021-03-05 12:04:27 | 9999.897 |
| 2021-03-05 12:04:58 | 9999.897 |
| 2021-03-05 12:05:29 | 9999.897 |
| 2021-03-05 12:06:00 | 9999.897 |
| 2021-03-05 12:06:30 | 9999.897 |
| 2021-03-05 12:07:01 | 9999.897 |
| 2021-03-05 12:07:32 | 9999.897 |
| 2021-03-05 12:08:02 | 9999.897 |
| 2021-03-05 12:08:33 | 9999.897 |
| 2021-03-05 12:09:04 | 9999.897 |
| 2021-03-05 12:09:34 | 9999.897 |
| 2021-03-05 12:10:05 | 9999.897 |
| 2021-03-05 12:10:36 | 9999.897 |
| 2021-03-05 12:11:06 | 9999.897 |
| 2021-03-05 12:11:37 | 9999.897 |
| 2021-03-05 12:12:08 | 9999.897 |
| 2021-03-05 12:12:38 | 9999.897 |
| 2021-03-05 12:13:09 | 9999.897 |
| 2021-03-05 12:13:40 | 9999.897 |
| 2021-03-05 12:14:10 | 9999.897 |
| 2021-03-05 12:14:41 | 9999.897 |
| 2021-03-05 12:15:12 | 9999.897 |
| 2021-03-05 12:15:42 | 9999.897 |
| 2021-03-05 12:16:13 | 9999.897 |
| 2021-03-05 12:16:44 | 9999.897 |
| 2021-03-05 12:17:14 | 9999.897 |
| 2021-03-05 12:17:45 | 9999.897 |
| 2021-03-05 12:18:16 | 9999.897 |
| 2021-03-05 12:18:47 | 9999.897 |
| 2021-03-05 12:19:17 | 9999.897 |
| 2021-03-05 12:19:48 | 9999.897 |
| 2021-03-05 12:20:19 | 9999.897 |
| 2021-03-05 12:20:49 | 9999.897 |
| 2021-03-05 12:21:20 | 9999.897 |
| 2021-03-05 12:21:51 | 9999.897 |
| 2021-03-05 12:22:21 | 9999.897 |
| 2021-03-05 12:22:52 | 9999.897 |
| 2021-03-05 12:23:23 | 9999.897 |
| 2021-03-05 12:23:53 | 9999.897 |
| 2021-03-05 12:24:24 | 9999.897 |
| 2021-03-05 12:24:55 | 9999.897 |
| 2021-03-05 12:25:25 | 9999.897 |
| 2021-03-05 12:25:56 | 9999.897 |
| 2021-03-05 12:26:27 | 9999.897 |
| 2021-03-05 12:26:57 | 9999.897 |
| 2021-03-05 12:27:28 | 9999.897 |
| 2021-03-05 12:27:59 | 9999.897 |
| 2021-03-05 12:28:29 | 9999.897 |
| 2021-03-05 12:29:00 | 9999.897 |
| 2021-03-05 12:29:31 | 9999.897 |
| 2021-03-05 12:30:01 | 9999.897 |
| 2021-03-05 12:30:32 | 9999.897 |
| 2021-03-05 12:31:03 | 9999.897 |
| 2021-03-05 12:31:34 | 9999.897 |
| 2021-03-05 12:32:04 | 9999.897 |
| 2021-03-05 12:32:35 | 9999.897 |
| 2021-03-05 12:33:06 | 9999.897 |
| 2021-03-05 12:33:36 | 9999.897 |
| 2021-03-05 12:34:07 | 9999.897 |
| 2021-03-05 12:34:38 | 9999.897 |
| 2021-03-05 12:35:08 | 9999.897 |
| 2021-03-05 12:35:39 | 9999.897 |
| 2021-03-05 12:36:10 | 9999.897 |
| 2021-03-05 12:36:40 | 9999.897 |
| 2021-03-05 12:37:11 | 9999.897 |
| 2021-03-05 12:37:42 | 9999.897 |
| 2021-03-05 12:38:12 | 9999.897 |
| 2021-03-05 12:38:43 | 9999.897 |
| 2021-03-05 12:39:14 | 9999.897 |
| 2021-03-05 12:39:44 | 9999.897 |
| 2021-03-05 12:40:15 | 9999.897 |
| 2021-03-05 12:40:46 | 9999.897 |
| 2021-03-05 12:41:16 | 9999.897 |
| 2021-03-05 12:41:47 | 9999.897 |
| 2021-03-05 12:42:18 | 9999.897 |
| 2021-03-05 12:42:48 | 9999.897 |
| 2021-03-05 12:43:19 | 9999.897 |
| 2021-03-05 12:43:50 | 9999.897 |
| 2021-03-05 12:44:20 | 9999.897 |
| 2021-03-05 12:44:51 | 9999.897 |
| 2021-03-05 12:45:22 | 9999.897 |
| 2021-03-05 12:45:53 | 9999.897 |
| 2021-03-05 12:46:23 | 9999.897 |
| 2021-03-05 12:46:54 | 9999.897 |
| 2021-03-05 12:47:25 | 9999.897 |
| 2021-03-05 12:47:55 | 9999.897 |
| 2021-03-05 12:48:26 | 9999.897 |
| 2021-03-05 12:48:57 | 9999.897 |
| 2021-03-05 12:49:27 | 9999.897 |
| 2021-03-05 12:49:58 | 9999.897 |
| 2021-03-05 12:50:29 | 9999.897 |
| 2021-03-05 12:50:59 | 9999.897 |
| 2021-03-05 12:51:30 | 9999.897 |
| 2021-03-05 12:52:01 | 9999.897 |
| 2021-03-05 12:52:31 | 9999.897 |
| 2021-03-05 12:53:02 | 9999.897 |
| 2021-03-05 12:53:33 | 9999.897 |
| 2021-03-05 12:54:03 | 9999.897 |
| 2021-03-05 12:54:34 | 9999.897 |
| 2021-03-05 12:55:05 | 9999.897 |
| 2021-03-05 12:55:35 | 9999.897 |
| 2021-03-05 12:56:06 | 9999.897 |
| 2021-03-05 12:56:37 | 9999.897 |
| 2021-03-05 12:57:07 | 9999.897 |
| 2021-03-05 12:57:38 | 9999.897 |
| 2021-03-05 12:58:09 | 9999.897 |
| 2021-03-05 12:58:40 | 9999.897 |
| 2021-03-05 12:59:10 | 9999.897 |
| 2021-03-05 12:59:41 | 9999.897 |
| 2021-03-05 13:00:12 | 9999.897 |
| 2021-03-05 13:00:42 | 9999.897 |
| 2021-03-05 13:01:13 | 9999.897 |
| 2021-03-05 13:01:44 | 9999.897 |
| 2021-03-05 13:02:14 | 9999.897 |
| 2021-03-05 13:02:45 | 9999.897 |
| 2021-03-05 13:03:16 | 9999.897 |
| 2021-03-05 13:03:46 | 9999.897 |
| 2021-03-05 13:04:17 | 9999.897 |
| 2021-03-05 13:04:48 | 9999.897 |
| 2021-03-05 13:05:18 | 9999.897 |
| 2021-03-05 13:05:49 | 9999.897 |
| 2021-03-05 13:06:20 | 9999.897 |
| 2021-03-05 13:06:50 | 9999.897 |
| 2021-03-05 13:07:21 | 9999.897 |
| 2021-03-05 13:07:52 | 9999.897 |
| 2021-03-05 13:08:22 | 9999.897 |
| 2021-03-05 13:08:53 | 9999.897 |
| 2021-03-05 13:09:24 | 9999.897 |
| 2021-03-05 13:09:55 | 9999.897 |
| 2021-03-05 13:10:25 | 9999.897 |
| 2021-03-05 13:10:56 | 9999.897 |
| 2021-03-05 13:11:27 | 9999.897 |
| 2021-03-05 13:11:57 | 9999.897 |
| 2021-03-05 13:12:28 | 9999.897 |
| 2021-03-05 13:12:59 | 9999.897 |
| 2021-03-05 13:13:29 | 9999.897 |
| 2021-03-05 13:14:00 | 9999.897 |
| 2021-03-05 13:14:31 | 9999.897 |
| 2021-03-05 13:15:01 | 9999.897 |
| 2021-03-05 13:15:32 | 9999.897 |
| 2021-03-05 13:16:03 | 9999.897 |
| 2021-03-05 13:16:33 | 9999.897 |
| 2021-03-05 13:17:04 | 9999.897 |
| 2021-03-05 13:17:35 | 9999.897 |
| 2021-03-05 13:18:05 | 9999.897 |
| 2021-03-05 13:18:36 | 9999.897 |
| 2021-03-05 13:19:07 | 9999.897 |
| 2021-03-05 13:19:38 | 9999.897 |
| 2021-03-05 13:20:08 | 9999.897 |
| 2021-03-05 13:20:39 | 9999.897 |
| 2021-03-05 13:21:10 | 9999.897 |
| 2021-03-05 13:21:40 | 9999.897 |
| 2021-03-05 13:22:11 | 9999.897 |
| 2021-03-05 13:22:42 | 9999.897 |
| 2021-03-05 13:23:12 | 9999.897 |
| 2021-03-05 13:23:43 | 9999.897 |
| 2021-03-05 13:24:14 | 9999.897 |
| 2021-03-05 13:24:44 | 9999.897 |
| 2021-03-05 13:25:15 | 9999.897 |
| 2021-03-05 13:25:46 | 9999.897 |
| 2021-03-05 13:26:16 | 9999.897 |
| 2021-03-05 13:26:47 | 9999.897 |
| 2021-03-05 13:27:18 | 9999.897 |
| 2021-03-05 13:27:48 | 9999.897 |
| 2021-03-05 13:28:19 | 9999.897 |
| 2021-03-05 13:28:50 | 9999.897 |
| 2021-03-05 13:29:20 | 9999.897 |
| 2021-03-05 13:29:51 | 9999.897 |
| 2021-03-05 13:30:22 | 9999.897 |
| 2021-03-05 13:30:53 | 9999.897 |
| 2021-03-05 13:31:23 | 9999.897 |
| 2021-03-05 13:31:54 | 9999.897 |
| 2021-03-05 13:32:25 | 9999.897 |
| 2021-03-05 13:32:55 | 9999.897 |
| 2021-03-05 13:33:26 | 9999.897 |
| 2021-03-05 13:33:57 | 9999.897 |
| 2021-03-05 13:34:27 | 9999.897 |
| 2021-03-05 13:34:58 | 9999.897 |
| 2021-03-05 13:35:29 | 9999.897 |
| 2021-03-05 13:35:59 | 9999.897 |
| 2021-03-05 13:36:30 | 9999.897 |
| 2021-03-05 13:37:01 | 9999.897 |
| 2021-03-05 13:37:31 | 9999.897 |
| 2021-03-05 13:38:02 | 9999.897 |
| 2021-03-05 13:38:33 | 9999.897 |
| 2021-03-05 13:39:03 | 9999.897 |
| 2021-03-05 13:39:34 | 9999.897 |
| 2021-03-05 13:40:05 | 9999.897 |
| 2021-03-05 13:40:35 | 9999.897 |
| 2021-03-05 13:41:06 | 9999.897 |
| 2021-03-05 13:41:37 | 9999.897 |
| 2021-03-05 13:42:08 | 9999.897 |
| 2021-03-05 13:42:38 | 9999.897 |
| 2021-03-05 13:43:09 | 9999.897 |
| 2021-03-05 13:43:40 | 9999.897 |
| 2021-03-05 13:44:10 | 9999.898 |
| 2021-03-05 13:44:41 | 9999.898 |
| 2021-03-05 13:45:12 | 9999.897 |
| 2021-03-05 13:45:42 | 9999.897 |
| 2021-03-05 13:46:13 | 9999.897 |
| 2021-03-05 13:46:44 | 9999.897 |
| 2021-03-05 13:47:14 | 9999.897 |
| 2021-03-05 13:47:45 | 9999.897 |
| 2021-03-05 13:48:16 | 9999.898 |
| 2021-03-05 13:48:46 | 9999.898 |
| 2021-03-05 13:49:17 | 9999.898 |
| 2021-03-05 13:49:48 | 9999.898 |
| 2021-03-05 13:50:18 | 9999.898 |
| 2021-03-05 13:50:49 | 9999.898 |
| 2021-03-05 13:51:20 | 9999.898 |
| 2021-03-05 13:51:50 | 9999.898 |
| 2021-03-05 13:52:21 | 9999.898 |
| 2021-03-05 13:52:52 | 9999.897 |
| 2021-03-05 13:53:22 | 9999.897 |
| 2021-03-05 13:53:53 | 9999.897 |
| 2021-03-05 13:54:24 | 9999.897 |
| 2021-03-05 13:54:55 | 9999.897 |
| 2021-03-05 13:55:25 | 9999.897 |
| 2021-03-05 13:55:56 | 9999.897 |
| 2021-03-05 13:56:27 | 9999.897 |
| 2021-03-05 13:56:57 | 9999.897 |
| 2021-03-05 13:57:28 | 9999.897 |
| 2021-03-05 13:57:59 | 9999.897 |
| 2021-03-05 13:58:29 | 9999.897 |
| 2021-03-05 13:59:00 | 9999.897 |
| 2021-03-05 13:59:31 | 9999.897 |
| 2021-03-05 14:00:01 | 9999.897 |
| 2021-03-05 14:00:32 | 9999.897 |
| 2021-03-05 14:01:03 | 9999.897 |
| 2021-03-05 14:01:33 | 9999.897 |
| 2021-03-05 14:02:04 | 9999.897 |
| 2021-03-05 14:02:35 | 9999.897 |
| 2021-03-05 14:03:05 | 9999.897 |
| 2021-03-05 14:03:36 | 9999.897 |
| 2021-03-05 14:04:07 | 9999.897 |
| 2021-03-05 14:04:37 | 9999.897 |
| 2021-03-05 14:05:08 | 9999.897 |
| 2021-03-05 14:05:39 | 9999.897 |
| 2021-03-05 14:06:10 | 9999.897 |
| 2021-03-05 14:06:40 | 9999.897 |
| 2021-03-05 14:07:11 | 9999.897 |
| 2021-03-05 14:07:42 | 9999.897 |
| 2021-03-05 14:08:12 | 9999.897 |
| 2021-03-05 14:08:43 | 9999.897 |
| 2021-03-05 14:09:14 | 9999.897 |
| 2021-03-05 14:09:44 | 9999.897 |
| 2021-03-05 14:10:15 | 9999.897 |
| 2021-03-05 14:10:46 | 9999.897 |
| 2021-03-05 14:11:16 | 9999.897 |
| 2021-03-05 14:11:47 | 9999.897 |
| 2021-03-05 14:12:18 | 9999.897 |
| 2021-03-05 14:12:48 | 9999.897 |
| 2021-03-05 14:13:19 | 9999.897 |
| 2021-03-05 14:13:50 | 9999.897 |
| 2021-03-05 14:14:20 | 9999.897 |
| 2021-03-05 14:14:51 | 9999.897 |
| 2021-03-05 14:15:22 | 9999.897 |
| 2021-03-05 14:15:52 | 9999.897 |
| 2021-03-05 14:16:23 | 9999.897 |
| 2021-03-05 14:16:54 | 9999.897 |
| 2021-03-05 14:17:24 | 9999.897 |
| 2021-03-05 14:17:55 | 9999.897 |
| 2021-03-05 14:18:26 | 9999.897 |
| 2021-03-05 14:18:57 | 9999.897 |
| 2021-03-05 14:19:27 | 9999.897 |
| 2021-03-05 14:19:58 | 9999.897 |
| 2021-03-05 14:20:29 | 9999.897 |
| 2021-03-05 14:20:59 | 9999.897 |
| 2021-03-05 14:21:30 | 9999.897 |
| 2021-03-05 14:22:01 | 9999.897 |
| 2021-03-05 14:22:31 | 9999.897 |
| 2021-03-05 14:23:02 | 9999.897 |
| 2021-03-05 14:23:33 | 9999.897 |
| 2021-03-05 14:24:03 | 9999.897 |
| 2021-03-05 14:24:34 | 9999.897 |
| 2021-03-05 14:25:05 | 9999.897 |
| 2021-03-05 14:25:35 | 9999.897 |
| 2021-03-05 14:26:06 | 9999.897 |
| 2021-03-05 14:26:37 | 9999.897 |
| 2021-03-05 14:27:07 | 9999.897 |
| 2021-03-05 14:27:38 | 9999.897 |
| 2021-03-05 14:28:09 | 9999.897 |
| 2021-03-05 14:28:39 | 9999.897 |
| 2021-03-05 14:29:10 | 9999.897 |
| 2021-03-05 14:29:41 | 9999.897 |
| 2021-03-05 14:30:11 | 9999.897 |
| 2021-03-05 14:30:42 | 9999.897 |
| 2021-03-05 14:31:13 | 9999.897 |
| 2021-03-05 14:31:43 | 9999.897 |
| 2021-03-05 14:32:14 | 9999.897 |
| 2021-03-05 14:32:45 | 9999.897 |
| 2021-03-05 14:33:16 | 9999.897 |
| 2021-03-05 14:33:46 | 9999.897 |
| 2021-03-05 14:34:17 | 9999.897 |
| 2021-03-05 14:34:48 | 9999.897 |
| 2021-03-05 14:35:18 | 9999.897 |
| 2021-03-05 14:35:49 | 9999.897 |
| 2021-03-05 14:36:20 | 9999.897 |
| 2021-03-05 14:36:50 | 9999.897 |
| 2021-03-05 14:37:21 | 9999.897 |
| 2021-03-05 14:37:52 | 9999.897 |
| 2021-03-05 14:38:22 | 9999.897 |
| 2021-03-05 14:38:53 | 9999.897 |
| 2021-03-05 14:39:24 | 9999.897 |
| 2021-03-05 14:39:54 | 9999.897 |
| 2021-03-05 14:40:25 | 9999.897 |
| 2021-03-05 14:40:56 | 9999.897 |
| 2021-03-05 14:41:26 | 9999.897 |
| 2021-03-05 14:41:57 | 9999.897 |
| 2021-03-05 14:42:28 | 9999.897 |
| 2021-03-05 14:42:58 | 9999.897 |
| 2021-03-05 14:43:29 | 9999.897 |
| 2021-03-05 14:44:00 | 9999.897 |
| 2021-03-05 14:44:31 | 9999.897 |
| 2021-03-05 14:45:01 | 9999.897 |
| 2021-03-05 14:45:32 | 9999.897 |
| 2021-03-05 14:46:03 | 9999.897 |
| 2021-03-05 14:46:33 | 9999.897 |
| 2021-03-05 14:47:04 | 9999.897 |
| 2021-03-05 14:47:35 | 9999.897 |
| 2021-03-05 14:48:05 | 9999.897 |
| 2021-03-05 14:48:36 | 9999.897 |
| 2021-03-05 14:49:07 | 9999.897 |
| 2021-03-05 14:49:37 | 9999.897 |
| 2021-03-05 14:50:08 | 9999.897 |
| 2021-03-05 14:50:39 | 9999.897 |
| 2021-03-05 14:51:09 | 9999.897 |
| 2021-03-05 14:51:40 | 9999.897 |
| 2021-03-05 14:52:11 | 9999.897 |
| 2021-03-05 14:52:41 | 9999.897 |
| 2021-03-05 14:53:12 | 9999.897 |
| 2021-03-05 14:53:43 | 9999.897 |
| 2021-03-05 14:54:13 | 9999.897 |
| 2021-03-05 14:54:44 | 9999.897 |
| 2021-03-05 14:55:15 | 9999.897 |
| 2021-03-05 14:55:45 | 9999.897 |
| 2021-03-05 14:56:16 | 9999.897 |
| 2021-03-05 14:56:47 | 9999.897 |
| 2021-03-05 14:57:18 | 9999.897 |
| 2021-03-05 14:57:48 | 9999.897 |
| 2021-03-05 14:58:19 | 9999.897 |
| 2021-03-05 14:58:50 | 9999.897 |
| 2021-03-05 14:59:20 | 9999.897 |
| 2021-03-05 14:59:51 | 9999.897 |
| 2021-03-05 15:00:22 | 9999.897 |
| 2021-03-05 15:00:52 | 9999.897 |
| 2021-03-05 15:01:23 | 9999.897 |
| 2021-03-05 15:01:54 | 9999.897 |
| 2021-03-05 15:02:24 | 9999.897 |
| 2021-03-05 15:02:55 | 9999.897 |
| 2021-03-05 15:03:26 | 9999.897 |
| 2021-03-05 15:03:56 | 9999.897 |
| 2021-03-05 15:04:27 | 9999.897 |
| 2021-03-05 15:04:58 | 9999.897 |
| 2021-03-05 15:05:28 | 9999.897 |
| 2021-03-05 15:05:59 | 9999.897 |
| 2021-03-05 15:06:30 | 9999.897 |
| 2021-03-05 15:07:00 | 9999.897 |
| 2021-03-05 15:07:31 | 9999.897 |
| 2021-03-05 15:08:02 | 9999.897 |
| 2021-03-05 15:08:33 | 9999.897 |
| 2021-03-05 15:09:03 | 9999.897 |
| 2021-03-05 15:09:34 | 9999.897 |
| 2021-03-05 15:10:05 | 9999.897 |
| 2021-03-05 15:10:35 | 9999.897 |
| 2021-03-05 15:11:06 | 9999.897 |
| 2021-03-05 15:11:37 | 9999.897 |
| 2021-03-05 15:12:07 | 9999.897 |
| 2021-03-05 15:12:38 | 9999.897 |
| 2021-03-05 15:13:09 | 9999.897 |
| 2021-03-05 15:13:39 | 9999.897 |
| 2021-03-05 15:14:10 | 9999.897 |
| 2021-03-05 15:14:41 | 9999.897 |
| 2021-03-05 15:15:11 | 9999.897 |
| 2021-03-05 15:15:42 | 9999.897 |
| 2021-03-05 15:16:13 | 9999.897 |
| 2021-03-05 15:16:43 | 9999.897 |
| 2021-03-05 15:17:14 | 9999.897 |
| 2021-03-05 15:17:45 | 9999.897 |
| 2021-03-05 15:18:15 | 9999.897 |
| 2021-03-05 15:18:46 | 9999.897 |
| 2021-03-05 15:19:17 | 9999.897 |
| 2021-03-05 15:19:48 | 9999.897 |
| 2021-03-05 15:20:18 | 9999.897 |
| 2021-03-05 15:20:49 | 9999.897 |
| 2021-03-05 15:21:20 | 9999.897 |
| 2021-03-05 15:21:50 | 9999.897 |
| 2021-03-05 15:22:21 | 9999.897 |
| 2021-03-05 15:22:52 | 9999.897 |
| 2021-03-05 15:23:22 | 9999.897 |
| 2021-03-05 15:23:53 | 9999.897 |
| 2021-03-05 15:24:24 | 9999.897 |
| 2021-03-05 15:24:54 | 9999.897 |
| 2021-03-05 15:25:25 | 9999.897 |
| 2021-03-05 15:25:56 | 9999.897 |
| 2021-03-05 15:26:26 | 9999.897 |
| 2021-03-05 15:26:57 | 9999.897 |
| 2021-03-05 15:27:28 | 9999.897 |
| 2021-03-05 15:27:58 | 9999.897 |
| 2021-03-05 15:28:29 | 9999.897 |
| 2021-03-05 15:29:00 | 9999.897 |
| 2021-03-05 15:29:30 | 9999.897 |
| 2021-03-05 15:30:01 | 9999.897 |
| 2021-03-05 15:30:32 | 9999.897 |
| 2021-03-05 15:31:03 | 9999.897 |
| 2021-03-05 15:31:33 | 9999.897 |
| 2021-03-05 15:32:04 | 9999.897 |
| 2021-03-05 15:32:35 | 9999.897 |
| 2021-03-05 15:33:05 | 9999.897 |
| 2021-03-05 15:33:36 | 9999.897 |
| 2021-03-05 15:34:07 | 9999.897 |
| 2021-03-05 15:34:37 | 9999.897 |
| 2021-03-05 15:35:08 | 9999.897 |
| 2021-03-05 15:35:39 | 9999.897 |
| 2021-03-05 15:36:09 | 9999.897 |
| 2021-03-05 15:36:40 | 9999.897 |
| 2021-03-05 15:37:11 | 9999.897 |
| 2021-03-05 15:37:41 | 9999.897 |
| 2021-03-05 15:38:12 | 9999.897 |
| 2021-03-05 15:38:43 | 9999.897 |
| 2021-03-05 15:39:13 | 9999.897 |
| 2021-03-05 15:39:44 | 9999.897 |
| 2021-03-05 15:40:15 | 9999.897 |
| 2021-03-05 15:40:45 | 9999.897 |
| 2021-03-05 15:41:16 | 9999.897 |
| 2021-03-05 15:41:47 | 9999.897 |
| 2021-03-05 15:42:17 | 9999.897 |
| 2021-03-05 15:42:48 | 9999.897 |
| 2021-03-05 15:43:19 | 9999.897 |
| 2021-03-05 15:43:49 | 9999.897 |
| 2021-03-05 15:44:20 | 9999.897 |
| 2021-03-05 15:44:51 | 9999.897 |
| 2021-03-05 15:45:22 | 9999.897 |
| 2021-03-05 15:45:52 | 9999.897 |
| 2021-03-05 15:46:23 | 9999.897 |
| 2021-03-05 15:46:54 | 9999.897 |
| 2021-03-05 15:47:24 | 9999.897 |
| 2021-03-05 15:47:55 | 9999.897 |
| 2021-03-05 15:48:26 | 9999.897 |
| 2021-03-05 15:48:56 | 9999.897 |
| 2021-03-05 15:49:27 | 9999.897 |
| 2021-03-05 15:49:58 | 9999.897 |
| 2021-03-05 15:50:28 | 9999.897 |
| 2021-03-05 15:50:59 | 9999.897 |
| 2021-03-05 15:51:30 | 9999.897 |
| 2021-03-05 15:52:00 | 9999.897 |
| 2021-03-05 15:52:31 | 9999.897 |
| 2021-03-05 15:53:02 | 9999.897 |
| 2021-03-05 15:53:32 | 9999.897 |
| 2021-03-05 15:54:03 | 9999.897 |
| 2021-03-05 15:54:34 | 9999.897 |
| 2021-03-05 15:55:04 | 9999.897 |
| 2021-03-05 15:55:35 | 9999.897 |
| 2021-03-05 15:56:06 | 9999.897 |
| 2021-03-05 15:56:36 | 9999.897 |
| 2021-03-05 15:57:07 | 9999.897 |
| 2021-03-05 15:57:38 | 9999.897 |
| 2021-03-05 15:58:09 | 9999.897 |
| 2021-03-05 15:58:39 | 9999.897 |
| 2021-03-05 15:59:10 | 9999.897 |
| 2021-03-05 15:59:41 | 9999.897 |
| 2021-03-05 16:00:11 | 9999.897 |
| 2021-03-05 16:00:42 | 9999.897 |
| 2021-03-05 16:01:13 | 9999.897 |
| 2021-03-05 16:01:43 | 9999.897 |
| 2021-03-05 16:02:14 | 9999.897 |
| 2021-03-05 16:02:45 | 9999.897 |
| 2021-03-05 16:03:15 | 9999.897 |
| 2021-03-05 16:03:46 | 9999.897 |
| 2021-03-05 16:04:17 | 9999.897 |
| 2021-03-05 16:04:47 | 9999.897 |
| 2021-03-05 16:05:18 | 9999.897 |
| 2021-03-05 16:05:49 | 9999.897 |
| 2021-03-05 16:06:19 | 9999.897 |
| 2021-03-05 16:06:50 | 9999.897 |
| 2021-03-05 16:07:21 | 9999.897 |
| 2021-03-05 16:07:51 | 9999.897 |
| 2021-03-05 16:08:22 | 9999.897 |
| 2021-03-05 16:08:53 | 9999.897 |
| 2021-03-05 16:09:23 | 9999.897 |
| 2021-03-05 16:09:54 | 9999.897 |
| 2021-03-05 16:10:25 | 9999.897 |
| 2021-03-05 16:10:55 | 9999.897 |
| 2021-03-05 16:11:26 | 9999.897 |
| 2021-03-05 16:11:57 | 9999.897 |
| 2021-03-05 16:12:28 | 9999.897 |
| 2021-03-05 16:12:58 | 9999.897 |
| 2021-03-05 16:13:29 | 9999.897 |
| 2021-03-05 16:14:00 | 9999.897 |
| 2021-03-05 16:14:30 | 9999.897 |
| 2021-03-05 16:15:01 | 9999.897 |
| 2021-03-05 16:15:32 | 9999.897 |
| 2021-03-05 16:16:02 | 9999.897 |
| 2021-03-05 16:16:33 | 9999.897 |
| 2021-03-05 16:17:04 | 9999.897 |
| 2021-03-05 16:17:34 | 9999.897 |
| 2021-03-05 16:18:05 | 9999.897 |
| 2021-03-05 16:18:36 | 9999.897 |
| 2021-03-05 16:19:06 | 9999.897 |
| 2021-03-05 16:19:37 | 9999.897 |
| 2021-03-05 16:20:08 | 9999.897 |
| 2021-03-05 16:20:38 | 9999.897 |
| 2021-03-05 16:21:09 | 9999.897 |
| 2021-03-05 16:21:40 | 9999.897 |
| 2021-03-05 16:22:10 | 9999.897 |
| 2021-03-05 16:22:41 | 9999.897 |
| 2021-03-05 16:23:12 | 9999.897 |
| 2021-03-05 16:23:42 | 9999.897 |
| 2021-03-05 16:24:13 | 9999.897 |
| 2021-03-05 16:24:44 | 9999.897 |
| 2021-03-05 16:25:15 | 9999.897 |
| 2021-03-05 16:25:45 | 9999.897 |
| 2021-03-05 16:26:16 | 9999.897 |
| 2021-03-05 16:26:47 | 9999.897 |
| 2021-03-05 16:27:17 | 9999.897 |
| 2021-03-05 16:27:48 | 9999.897 |
| 2021-03-05 16:28:19 | 9999.897 |
| 2021-03-05 16:28:49 | 9999.897 |
| 2021-03-05 16:29:20 | 9999.897 |
| 2021-03-05 16:29:51 | 9999.897 |
| 2021-03-05 16:30:21 | 9999.897 |
| 2021-03-05 16:30:52 | 9999.897 |
| 2021-03-05 16:31:23 | 9999.897 |
| 2021-03-05 16:31:53 | 9999.897 |
| 2021-03-05 16:32:24 | 9999.897 |
| 2021-03-05 16:32:55 | 9999.897 |
| 2021-03-05 16:33:25 | 9999.897 |
| 2021-03-05 16:33:56 | 9999.898 |
| 2021-03-05 16:34:27 | 9999.897 |
| 2021-03-05 16:34:57 | 9999.897 |
| 2021-03-05 16:35:28 | 9999.897 |
| 2021-03-05 16:35:59 | 9999.897 |
| 2021-03-05 16:36:30 | 9999.897 |
| 2021-03-05 16:37:00 | 9999.897 |
| 2021-03-05 16:37:31 | 9999.897 |
| 2021-03-05 16:38:02 | 9999.897 |
| 2021-03-05 16:38:32 | 9999.898 |
| 2021-03-05 16:39:03 | 9999.898 |
| 2021-03-05 16:39:34 | 9999.898 |
| 2021-03-05 16:40:04 | 9999.898 |
| 2021-03-05 16:40:35 | 9999.898 |
| 2021-03-05 16:41:06 | 9999.898 |
| 2021-03-05 16:41:36 | 9999.898 |
| 2021-03-05 16:42:07 | 9999.898 |
| 2021-03-05 16:42:38 | 9999.898 |
| 2021-03-05 16:43:08 | 9999.898 |
| 2021-03-05 16:43:39 | 9999.898 |
| 2021-03-05 16:44:10 | 9999.897 |
| 2021-03-05 16:44:40 | 9999.897 |
| 2021-03-05 16:45:11 | 9999.897 |
| 2021-03-05 16:45:42 | 9999.897 |
| 2021-03-05 16:46:12 | 9999.898 |
| 2021-03-05 16:46:43 | 9999.898 |
| 2021-03-05 16:47:14 | 9999.898 |
| 2021-03-05 16:47:44 | 9999.898 |
| 2021-03-05 16:48:15 | 9999.897 |
| 2021-03-05 16:48:46 | 9999.897 |
| 2021-03-05 16:49:16 | 9999.897 |
| 2021-03-05 16:49:47 | 9999.897 |
| 2021-03-05 16:50:18 | 9999.897 |
| 2021-03-05 16:50:49 | 9999.897 |
| 2021-03-05 16:51:19 | 9999.897 |
| 2021-03-05 16:51:50 | 9999.897 |
| 2021-03-05 16:52:21 | 9999.897 |
| 2021-03-05 16:52:51 | 9999.897 |
| 2021-03-05 16:53:22 | 9999.897 |
| 2021-03-05 16:53:53 | 9999.897 |
| 2021-03-05 16:54:23 | 9999.897 |
| 2021-03-05 16:54:54 | 9999.897 |
| 2021-03-05 16:55:25 | 9999.897 |
| 2021-03-05 16:55:55 | 9999.898 |
| 2021-03-05 16:56:26 | 9999.898 |
| 2021-03-05 16:56:57 | 9999.898 |
| 2021-03-05 16:57:27 | 9999.897 |
| 2021-03-05 16:57:58 | 9999.897 |
| 2021-03-05 16:58:29 | 9999.897 |
| 2021-03-05 16:58:59 | 9999.897 |
| 2021-03-05 16:59:30 | 9999.897 |
| 2021-03-05 17:00:01 | 9999.897 |
| 2021-03-05 17:00:31 | 9999.898 |
| 2021-03-05 17:01:02 | 9999.898 |
| 2021-03-05 17:01:33 | 9999.898 |
| 2021-03-05 17:02:04 | 9999.898 |
| 2021-03-05 17:02:34 | 9999.898 |
| 2021-03-05 17:03:05 | 9999.898 |
| 2021-03-05 17:03:36 | 9999.898 |
| 2021-03-05 17:04:06 | 9999.898 |
| 2021-03-05 17:04:37 | 9999.898 |
| 2021-03-05 17:05:08 | 9999.898 |
| 2021-03-05 17:05:38 | 9999.898 |
| 2021-03-05 17:06:09 | 9999.898 |
| 2021-03-05 17:06:40 | 9999.898 |
| 2021-03-05 17:07:10 | 9999.898 |
| 2021-03-05 17:07:41 | 9999.898 |
| 2021-03-05 17:08:12 | 9999.898 |
| 2021-03-05 17:08:42 | 9999.898 |
| 2021-03-05 17:09:13 | 9999.898 |
| 2021-03-05 17:09:44 | 9999.898 |
| 2021-03-05 17:10:14 | 9999.898 |
| 2021-03-05 17:10:45 | 9999.898 |
| 2021-03-05 17:11:16 | 9999.898 |
| 2021-03-05 17:11:46 | 9999.898 |
| 2021-03-05 17:12:17 | 9999.897 |
| 2021-03-05 17:12:48 | 9999.897 |
| 2021-03-05 17:13:19 | 9999.897 |
| 2021-03-05 17:13:49 | 9999.897 |
| 2021-03-05 17:14:20 | 9999.897 |
| 2021-03-05 17:14:51 | 9999.897 |
| 2021-03-05 17:15:21 | 9999.897 |
| 2021-03-05 17:15:52 | 9999.897 |
| 2021-03-05 17:16:23 | 9999.897 |
| 2021-03-05 17:16:53 | 9999.897 |
| 2021-03-05 17:17:24 | 9999.897 |
| 2021-03-05 17:17:55 | 9999.897 |
| 2021-03-05 17:18:25 | 9999.897 |
| 2021-03-05 17:18:56 | 9999.897 |
| 2021-03-05 17:19:27 | 9999.897 |
| 2021-03-05 17:19:57 | 9999.897 |
| 2021-03-05 17:20:28 | 9999.897 |
| 2021-03-05 17:20:59 | 9999.897 |
| 2021-03-05 17:21:29 | 9999.897 |
| 2021-03-05 17:22:00 | 9999.897 |
| 2021-03-05 17:22:31 | 9999.897 |
| 2021-03-05 17:23:02 | 9999.897 |
| 2021-03-05 17:23:32 | 9999.897 |
| 2021-03-05 17:24:03 | 9999.897 |
| 2021-03-05 17:24:34 | 9999.897 |
| 2021-03-05 17:25:04 | 9999.897 |
| 2021-03-05 17:25:35 | 9999.897 |
| 2021-03-05 17:26:06 | 9999.897 |
| 2021-03-05 17:26:36 | 9999.897 |
| 2021-03-05 17:27:07 | 9999.897 |
| 2021-03-05 17:27:38 | 9999.897 |
| 2021-03-05 17:28:08 | 9999.897 |
| 2021-03-05 17:28:39 | 9999.897 |
| 2021-03-05 17:29:10 | 9999.897 |
| 2021-03-05 17:29:40 | 9999.897 |
| 2021-03-05 17:30:11 | 9999.897 |
| 2021-03-05 17:30:42 | 9999.897 |
| 2021-03-05 17:31:12 | 9999.897 |
| 2021-03-05 17:31:43 | 9999.897 |
| 2021-03-05 17:32:14 | 9999.897 |
| 2021-03-05 17:32:45 | 9999.897 |
| 2021-03-05 17:33:15 | 9999.897 |
| 2021-03-05 17:33:46 | 9999.897 |
| 2021-03-05 17:34:17 | 9999.897 |
| 2021-03-05 17:34:47 | 9999.897 |
| 2021-03-05 17:35:18 | 9999.897 |